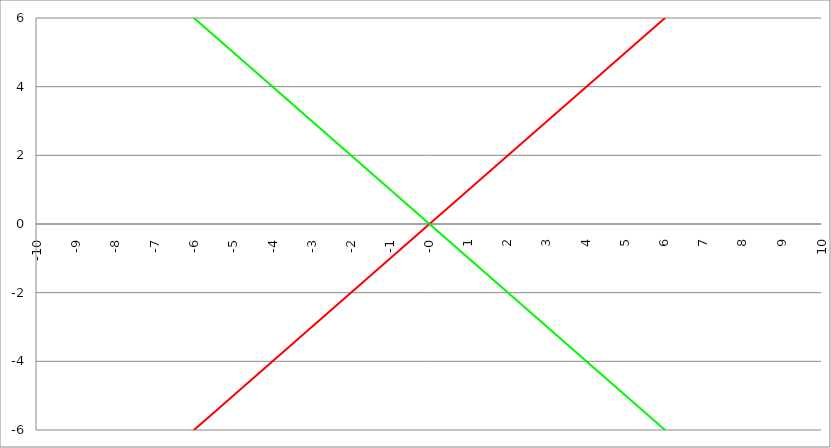
| Category | Series 1 | Series 0 | Series 2 |
|---|---|---|---|
| -10.0 | -10 | 10 |  |
| -9.99 | -9.99 | 9.99 |  |
| -9.98 | -9.98 | 9.98 |  |
| -9.97 | -9.97 | 9.97 |  |
| -9.96 | -9.96 | 9.96 |  |
| -9.95 | -9.95 | 9.95 |  |
| -9.940000000000001 | -9.94 | 9.94 |  |
| -9.930000000000001 | -9.93 | 9.93 |  |
| -9.920000000000002 | -9.92 | 9.92 |  |
| -9.91 | -9.91 | 9.91 |  |
| -9.900000000000002 | -9.9 | 9.9 |  |
| -9.890000000000002 | -9.89 | 9.89 |  |
| -9.880000000000003 | -9.88 | 9.88 |  |
| -9.870000000000003 | -9.87 | 9.87 |  |
| -9.860000000000001 | -9.86 | 9.86 |  |
| -9.850000000000003 | -9.85 | 9.85 |  |
| -9.840000000000003 | -9.84 | 9.84 |  |
| -9.830000000000004 | -9.83 | 9.83 |  |
| -9.820000000000004 | -9.82 | 9.82 |  |
| -9.810000000000004 | -9.81 | 9.81 |  |
| -9.800000000000004 | -9.8 | 9.8 |  |
| -9.790000000000004 | -9.79 | 9.79 |  |
| -9.780000000000005 | -9.78 | 9.78 |  |
| -9.770000000000005 | -9.77 | 9.77 |  |
| -9.760000000000005 | -9.76 | 9.76 |  |
| -9.750000000000005 | -9.75 | 9.75 |  |
| -9.740000000000006 | -9.74 | 9.74 |  |
| -9.730000000000006 | -9.73 | 9.73 |  |
| -9.720000000000006 | -9.72 | 9.72 |  |
| -9.710000000000006 | -9.71 | 9.71 |  |
| -9.700000000000006 | -9.7 | 9.7 |  |
| -9.690000000000007 | -9.69 | 9.69 |  |
| -9.680000000000007 | -9.68 | 9.68 |  |
| -9.670000000000007 | -9.67 | 9.67 |  |
| -9.660000000000007 | -9.66 | 9.66 |  |
| -9.650000000000007 | -9.65 | 9.65 |  |
| -9.640000000000008 | -9.64 | 9.64 |  |
| -9.630000000000008 | -9.63 | 9.63 |  |
| -9.620000000000008 | -9.62 | 9.62 |  |
| -9.610000000000008 | -9.61 | 9.61 |  |
| -9.600000000000009 | -9.6 | 9.6 |  |
| -9.590000000000009 | -9.59 | 9.59 |  |
| -9.580000000000007 | -9.58 | 9.58 |  |
| -9.57000000000001 | -9.57 | 9.57 |  |
| -9.56000000000001 | -9.56 | 9.56 |  |
| -9.55000000000001 | -9.55 | 9.55 |  |
| -9.54000000000001 | -9.54 | 9.54 |  |
| -9.53000000000001 | -9.53 | 9.53 |  |
| -9.52000000000001 | -9.52 | 9.52 |  |
| -9.51000000000001 | -9.51 | 9.51 |  |
| -9.50000000000001 | -9.5 | 9.5 |  |
| -9.49000000000001 | -9.49 | 9.49 |  |
| -9.48000000000001 | -9.48 | 9.48 |  |
| -9.47000000000001 | -9.47 | 9.47 |  |
| -9.46000000000001 | -9.46 | 9.46 |  |
| -9.45000000000001 | -9.45 | 9.45 |  |
| -9.44000000000001 | -9.44 | 9.44 |  |
| -9.430000000000012 | -9.43 | 9.43 |  |
| -9.420000000000012 | -9.42 | 9.42 |  |
| -9.410000000000013 | -9.41 | 9.41 |  |
| -9.400000000000013 | -9.4 | 9.4 |  |
| -9.390000000000011 | -9.39 | 9.39 |  |
| -9.380000000000013 | -9.38 | 9.38 |  |
| -9.370000000000013 | -9.37 | 9.37 |  |
| -9.360000000000014 | -9.36 | 9.36 |  |
| -9.350000000000014 | -9.35 | 9.35 |  |
| -9.340000000000014 | -9.34 | 9.34 |  |
| -9.330000000000014 | -9.33 | 9.33 |  |
| -9.320000000000014 | -9.32 | 9.32 |  |
| -9.310000000000015 | -9.31 | 9.31 |  |
| -9.300000000000013 | -9.3 | 9.3 |  |
| -9.290000000000015 | -9.29 | 9.29 |  |
| -9.280000000000015 | -9.28 | 9.28 |  |
| -9.270000000000016 | -9.27 | 9.27 |  |
| -9.260000000000016 | -9.26 | 9.26 |  |
| -9.250000000000014 | -9.25 | 9.25 |  |
| -9.240000000000016 | -9.24 | 9.24 |  |
| -9.230000000000016 | -9.23 | 9.23 |  |
| -9.220000000000017 | -9.22 | 9.22 |  |
| -9.210000000000017 | -9.21 | 9.21 |  |
| -9.200000000000017 | -9.2 | 9.2 |  |
| -9.190000000000017 | -9.19 | 9.19 |  |
| -9.180000000000017 | -9.18 | 9.18 |  |
| -9.170000000000018 | -9.17 | 9.17 |  |
| -9.160000000000016 | -9.16 | 9.16 |  |
| -9.150000000000018 | -9.15 | 9.15 |  |
| -9.140000000000018 | -9.14 | 9.14 |  |
| -9.130000000000019 | -9.13 | 9.13 |  |
| -9.120000000000019 | -9.12 | 9.12 |  |
| -9.110000000000017 | -9.11 | 9.11 |  |
| -9.10000000000002 | -9.1 | 9.1 |  |
| -9.09000000000002 | -9.09 | 9.09 |  |
| -9.08000000000002 | -9.08 | 9.08 |  |
| -9.07000000000002 | -9.07 | 9.07 |  |
| -9.06000000000002 | -9.06 | 9.06 |  |
| -9.05000000000002 | -9.05 | 9.05 |  |
| -9.04000000000002 | -9.04 | 9.04 |  |
| -9.03000000000002 | -9.03 | 9.03 |  |
| -9.020000000000021 | -9.02 | 9.02 |  |
| -9.010000000000021 | -9.01 | 9.01 |  |
| -9.000000000000021 | -9 | 9 |  |
| -8.990000000000022 | -8.99 | 8.99 |  |
| -8.980000000000022 | -8.98 | 8.98 |  |
| -8.97000000000002 | -8.97 | 8.97 |  |
| -8.960000000000022 | -8.96 | 8.96 |  |
| -8.950000000000022 | -8.95 | 8.95 |  |
| -8.940000000000023 | -8.94 | 8.94 |  |
| -8.930000000000023 | -8.93 | 8.93 |  |
| -8.920000000000023 | -8.92 | 8.92 |  |
| -8.910000000000023 | -8.91 | 8.91 |  |
| -8.900000000000023 | -8.9 | 8.9 |  |
| -8.890000000000024 | -8.89 | 8.89 |  |
| -8.880000000000024 | -8.88 | 8.88 |  |
| -8.870000000000024 | -8.87 | 8.87 |  |
| -8.860000000000024 | -8.86 | 8.86 |  |
| -8.850000000000025 | -8.85 | 8.85 |  |
| -8.840000000000025 | -8.84 | 8.84 |  |
| -8.830000000000025 | -8.83 | 8.83 |  |
| -8.820000000000025 | -8.82 | 8.82 |  |
| -8.810000000000025 | -8.81 | 8.81 |  |
| -8.800000000000026 | -8.8 | 8.8 |  |
| -8.790000000000026 | -8.79 | 8.79 |  |
| -8.780000000000026 | -8.78 | 8.78 |  |
| -8.770000000000026 | -8.77 | 8.77 |  |
| -8.760000000000026 | -8.76 | 8.76 |  |
| -8.750000000000027 | -8.75 | 8.75 |  |
| -8.740000000000027 | -8.74 | 8.74 |  |
| -8.730000000000027 | -8.73 | 8.73 |  |
| -8.720000000000027 | -8.72 | 8.72 |  |
| -8.710000000000027 | -8.71 | 8.71 |  |
| -8.700000000000028 | -8.7 | 8.7 |  |
| -8.690000000000028 | -8.69 | 8.69 |  |
| -8.680000000000028 | -8.68 | 8.68 |  |
| -8.670000000000028 | -8.67 | 8.67 |  |
| -8.660000000000029 | -8.66 | 8.66 |  |
| -8.650000000000029 | -8.65 | 8.65 |  |
| -8.640000000000029 | -8.64 | 8.64 |  |
| -8.63000000000003 | -8.63 | 8.63 |  |
| -8.62000000000003 | -8.62 | 8.62 |  |
| -8.61000000000003 | -8.61 | 8.61 |  |
| -8.60000000000003 | -8.6 | 8.6 |  |
| -8.59000000000003 | -8.59 | 8.59 |  |
| -8.58000000000003 | -8.58 | 8.58 |  |
| -8.57000000000003 | -8.57 | 8.57 |  |
| -8.56000000000003 | -8.56 | 8.56 |  |
| -8.55000000000003 | -8.55 | 8.55 |  |
| -8.540000000000031 | -8.54 | 8.54 |  |
| -8.530000000000031 | -8.53 | 8.53 |  |
| -8.520000000000032 | -8.52 | 8.52 |  |
| -8.510000000000032 | -8.51 | 8.51 |  |
| -8.50000000000003 | -8.5 | 8.5 |  |
| -8.490000000000032 | -8.49 | 8.49 |  |
| -8.480000000000032 | -8.48 | 8.48 |  |
| -8.470000000000033 | -8.47 | 8.47 |  |
| -8.460000000000033 | -8.46 | 8.46 |  |
| -8.450000000000033 | -8.45 | 8.45 |  |
| -8.440000000000033 | -8.44 | 8.44 |  |
| -8.430000000000033 | -8.43 | 8.43 |  |
| -8.420000000000034 | -8.42 | 8.42 |  |
| -8.410000000000032 | -8.41 | 8.41 |  |
| -8.400000000000034 | -8.4 | 8.4 |  |
| -8.390000000000034 | -8.39 | 8.39 |  |
| -8.380000000000035 | -8.38 | 8.38 |  |
| -8.370000000000035 | -8.37 | 8.37 |  |
| -8.360000000000033 | -8.36 | 8.36 |  |
| -8.350000000000035 | -8.35 | 8.35 |  |
| -8.340000000000035 | -8.34 | 8.34 |  |
| -8.330000000000036 | -8.33 | 8.33 |  |
| -8.320000000000036 | -8.32 | 8.32 |  |
| -8.310000000000034 | -8.31 | 8.31 |  |
| -8.300000000000036 | -8.3 | 8.3 |  |
| -8.290000000000036 | -8.29 | 8.29 |  |
| -8.280000000000037 | -8.28 | 8.28 |  |
| -8.270000000000037 | -8.27 | 8.27 |  |
| -8.260000000000037 | -8.26 | 8.26 |  |
| -8.250000000000037 | -8.25 | 8.25 |  |
| -8.240000000000038 | -8.24 | 8.24 |  |
| -8.230000000000038 | -8.23 | 8.23 |  |
| -8.220000000000038 | -8.22 | 8.22 |  |
| -8.210000000000038 | -8.21 | 8.21 |  |
| -8.200000000000038 | -8.2 | 8.2 |  |
| -8.190000000000039 | -8.19 | 8.19 |  |
| -8.180000000000039 | -8.18 | 8.18 |  |
| -8.170000000000037 | -8.17 | 8.17 |  |
| -8.16000000000004 | -8.16 | 8.16 |  |
| -8.15000000000004 | -8.15 | 8.15 |  |
| -8.14000000000004 | -8.14 | 8.14 |  |
| -8.13000000000004 | -8.13 | 8.13 |  |
| -8.12000000000004 | -8.12 | 8.12 |  |
| -8.11000000000004 | -8.11 | 8.11 |  |
| -8.10000000000004 | -8.1 | 8.1 |  |
| -8.09000000000004 | -8.09 | 8.09 |  |
| -8.08000000000004 | -8.08 | 8.08 |  |
| -8.07000000000004 | -8.07 | 8.07 |  |
| -8.06000000000004 | -8.06 | 8.06 |  |
| -8.05000000000004 | -8.05 | 8.05 |  |
| -8.040000000000042 | -8.04 | 8.04 |  |
| -8.03000000000004 | -8.03 | 8.03 |  |
| -8.020000000000042 | -8.02 | 8.02 |  |
| -8.010000000000042 | -8.01 | 8.01 |  |
| -8.000000000000043 | -8 | 8 |  |
| -7.990000000000043 | -7.99 | 7.99 |  |
| -7.980000000000043 | -7.98 | 7.98 |  |
| -7.970000000000043 | -7.97 | 7.97 |  |
| -7.960000000000043 | -7.96 | 7.96 |  |
| -7.950000000000044 | -7.95 | 7.95 |  |
| -7.940000000000044 | -7.94 | 7.94 |  |
| -7.930000000000044 | -7.93 | 7.93 |  |
| -7.920000000000044 | -7.92 | 7.92 |  |
| -7.910000000000044 | -7.91 | 7.91 |  |
| -7.900000000000044 | -7.9 | 7.9 |  |
| -7.890000000000045 | -7.89 | 7.89 |  |
| -7.880000000000045 | -7.88 | 7.88 |  |
| -7.870000000000045 | -7.87 | 7.87 |  |
| -7.860000000000046 | -7.86 | 7.86 |  |
| -7.850000000000046 | -7.85 | 7.85 |  |
| -7.840000000000046 | -7.84 | 7.84 |  |
| -7.830000000000046 | -7.83 | 7.83 |  |
| -7.820000000000046 | -7.82 | 7.82 |  |
| -7.810000000000047 | -7.81 | 7.81 |  |
| -7.800000000000047 | -7.8 | 7.8 |  |
| -7.790000000000047 | -7.79 | 7.79 |  |
| -7.780000000000047 | -7.78 | 7.78 |  |
| -7.770000000000047 | -7.77 | 7.77 |  |
| -7.760000000000048 | -7.76 | 7.76 |  |
| -7.750000000000048 | -7.75 | 7.75 |  |
| -7.740000000000048 | -7.74 | 7.74 |  |
| -7.730000000000048 | -7.73 | 7.73 |  |
| -7.720000000000049 | -7.72 | 7.72 |  |
| -7.710000000000049 | -7.71 | 7.71 |  |
| -7.700000000000049 | -7.7 | 7.7 |  |
| -7.690000000000049 | -7.69 | 7.69 |  |
| -7.680000000000049 | -7.68 | 7.68 |  |
| -7.67000000000005 | -7.67 | 7.67 |  |
| -7.66000000000005 | -7.66 | 7.66 |  |
| -7.65000000000005 | -7.65 | 7.65 |  |
| -7.64000000000005 | -7.64 | 7.64 |  |
| -7.63000000000005 | -7.63 | 7.63 |  |
| -7.620000000000051 | -7.62 | 7.62 |  |
| -7.610000000000051 | -7.61 | 7.61 |  |
| -7.600000000000051 | -7.6 | 7.6 |  |
| -7.590000000000051 | -7.59 | 7.59 |  |
| -7.580000000000052 | -7.58 | 7.58 |  |
| -7.570000000000052 | -7.57 | 7.57 |  |
| -7.560000000000052 | -7.56 | 7.56 |  |
| -7.550000000000052 | -7.55 | 7.55 |  |
| -7.540000000000052 | -7.54 | 7.54 |  |
| -7.530000000000053 | -7.53 | 7.53 |  |
| -7.520000000000053 | -7.52 | 7.52 |  |
| -7.510000000000053 | -7.51 | 7.51 |  |
| -7.500000000000053 | -7.5 | 7.5 |  |
| -7.490000000000053 | -7.49 | 7.49 |  |
| -7.480000000000054 | -7.48 | 7.48 |  |
| -7.470000000000054 | -7.47 | 7.47 |  |
| -7.460000000000054 | -7.46 | 7.46 |  |
| -7.450000000000054 | -7.45 | 7.45 |  |
| -7.440000000000054 | -7.44 | 7.44 |  |
| -7.430000000000054 | -7.43 | 7.43 |  |
| -7.420000000000055 | -7.42 | 7.42 |  |
| -7.410000000000055 | -7.41 | 7.41 |  |
| -7.400000000000055 | -7.4 | 7.4 |  |
| -7.390000000000056 | -7.39 | 7.39 |  |
| -7.380000000000056 | -7.38 | 7.38 |  |
| -7.370000000000056 | -7.37 | 7.37 |  |
| -7.360000000000056 | -7.36 | 7.36 |  |
| -7.350000000000056 | -7.35 | 7.35 |  |
| -7.340000000000057 | -7.34 | 7.34 |  |
| -7.330000000000057 | -7.33 | 7.33 |  |
| -7.320000000000057 | -7.32 | 7.32 |  |
| -7.310000000000057 | -7.31 | 7.31 |  |
| -7.300000000000058 | -7.3 | 7.3 |  |
| -7.290000000000058 | -7.29 | 7.29 |  |
| -7.280000000000058 | -7.28 | 7.28 |  |
| -7.270000000000058 | -7.27 | 7.27 |  |
| -7.260000000000058 | -7.26 | 7.26 |  |
| -7.250000000000059 | -7.25 | 7.25 |  |
| -7.240000000000059 | -7.24 | 7.24 |  |
| -7.23000000000006 | -7.23 | 7.23 |  |
| -7.220000000000059 | -7.22 | 7.22 |  |
| -7.210000000000059 | -7.21 | 7.21 |  |
| -7.20000000000006 | -7.2 | 7.2 |  |
| -7.19000000000006 | -7.19 | 7.19 |  |
| -7.18000000000006 | -7.18 | 7.18 |  |
| -7.17000000000006 | -7.17 | 7.17 |  |
| -7.160000000000061 | -7.16 | 7.16 |  |
| -7.150000000000061 | -7.15 | 7.15 |  |
| -7.140000000000061 | -7.14 | 7.14 |  |
| -7.130000000000061 | -7.13 | 7.13 |  |
| -7.120000000000061 | -7.12 | 7.12 |  |
| -7.110000000000062 | -7.11 | 7.11 |  |
| -7.100000000000062 | -7.1 | 7.1 |  |
| -7.090000000000062 | -7.09 | 7.09 |  |
| -7.080000000000062 | -7.08 | 7.08 |  |
| -7.070000000000062 | -7.07 | 7.07 |  |
| -7.060000000000063 | -7.06 | 7.06 |  |
| -7.050000000000063 | -7.05 | 7.05 |  |
| -7.040000000000063 | -7.04 | 7.04 |  |
| -7.030000000000063 | -7.03 | 7.03 |  |
| -7.020000000000064 | -7.02 | 7.02 |  |
| -7.010000000000064 | -7.01 | 7.01 |  |
| -7.000000000000064 | -7 | 7 |  |
| -6.990000000000064 | -6.99 | 6.99 |  |
| -6.980000000000064 | -6.98 | 6.98 |  |
| -6.970000000000064 | -6.97 | 6.97 |  |
| -6.960000000000064 | -6.96 | 6.96 |  |
| -6.950000000000064 | -6.95 | 6.95 |  |
| -6.940000000000065 | -6.94 | 6.94 |  |
| -6.930000000000065 | -6.93 | 6.93 |  |
| -6.920000000000065 | -6.92 | 6.92 |  |
| -6.910000000000065 | -6.91 | 6.91 |  |
| -6.900000000000066 | -6.9 | 6.9 |  |
| -6.890000000000066 | -6.89 | 6.89 |  |
| -6.880000000000066 | -6.88 | 6.88 |  |
| -6.870000000000066 | -6.87 | 6.87 |  |
| -6.860000000000067 | -6.86 | 6.86 |  |
| -6.850000000000067 | -6.85 | 6.85 |  |
| -6.840000000000067 | -6.84 | 6.84 |  |
| -6.830000000000067 | -6.83 | 6.83 |  |
| -6.820000000000068 | -6.82 | 6.82 |  |
| -6.810000000000068 | -6.81 | 6.81 |  |
| -6.800000000000068 | -6.8 | 6.8 |  |
| -6.790000000000068 | -6.79 | 6.79 |  |
| -6.780000000000068 | -6.78 | 6.78 |  |
| -6.770000000000068 | -6.77 | 6.77 |  |
| -6.760000000000069 | -6.76 | 6.76 |  |
| -6.75000000000007 | -6.75 | 6.75 |  |
| -6.74000000000007 | -6.74 | 6.74 |  |
| -6.73000000000007 | -6.73 | 6.73 |  |
| -6.72000000000007 | -6.72 | 6.72 |  |
| -6.71000000000007 | -6.71 | 6.71 |  |
| -6.70000000000007 | -6.7 | 6.7 |  |
| -6.69000000000007 | -6.69 | 6.69 |  |
| -6.680000000000071 | -6.68 | 6.68 |  |
| -6.670000000000071 | -6.67 | 6.67 |  |
| -6.660000000000071 | -6.66 | 6.66 |  |
| -6.650000000000071 | -6.65 | 6.65 |  |
| -6.640000000000072 | -6.64 | 6.64 |  |
| -6.630000000000072 | -6.63 | 6.63 |  |
| -6.620000000000072 | -6.62 | 6.62 |  |
| -6.610000000000072 | -6.61 | 6.61 |  |
| -6.600000000000072 | -6.6 | 6.6 |  |
| -6.590000000000073 | -6.59 | 6.59 |  |
| -6.580000000000073 | -6.58 | 6.58 |  |
| -6.570000000000073 | -6.57 | 6.57 |  |
| -6.560000000000073 | -6.56 | 6.56 |  |
| -6.550000000000074 | -6.55 | 6.55 |  |
| -6.540000000000074 | -6.54 | 6.54 |  |
| -6.530000000000074 | -6.53 | 6.53 |  |
| -6.520000000000074 | -6.52 | 6.52 |  |
| -6.510000000000074 | -6.51 | 6.51 |  |
| -6.500000000000074 | -6.5 | 6.5 |  |
| -6.490000000000074 | -6.49 | 6.49 |  |
| -6.480000000000074 | -6.48 | 6.48 |  |
| -6.470000000000075 | -6.47 | 6.47 |  |
| -6.460000000000075 | -6.46 | 6.46 |  |
| -6.450000000000075 | -6.45 | 6.45 |  |
| -6.440000000000075 | -6.44 | 6.44 |  |
| -6.430000000000076 | -6.43 | 6.43 |  |
| -6.420000000000076 | -6.42 | 6.42 |  |
| -6.410000000000076 | -6.41 | 6.41 |  |
| -6.400000000000076 | -6.4 | 6.4 |  |
| -6.390000000000077 | -6.39 | 6.39 |  |
| -6.380000000000077 | -6.38 | 6.38 |  |
| -6.370000000000077 | -6.37 | 6.37 |  |
| -6.360000000000078 | -6.36 | 6.36 |  |
| -6.350000000000078 | -6.35 | 6.35 |  |
| -6.340000000000078 | -6.34 | 6.34 |  |
| -6.330000000000078 | -6.33 | 6.33 |  |
| -6.320000000000078 | -6.32 | 6.32 |  |
| -6.310000000000079 | -6.31 | 6.31 |  |
| -6.300000000000079 | -6.3 | 6.3 |  |
| -6.29000000000008 | -6.29 | 6.29 |  |
| -6.28000000000008 | -6.28 | 6.28 |  |
| -6.27000000000008 | -6.27 | 6.27 |  |
| -6.26000000000008 | -6.26 | 6.26 |  |
| -6.25000000000008 | -6.25 | 6.25 |  |
| -6.24000000000008 | -6.24 | 6.24 |  |
| -6.23000000000008 | -6.23 | 6.23 |  |
| -6.220000000000081 | -6.22 | 6.22 |  |
| -6.210000000000081 | -6.21 | 6.21 |  |
| -6.200000000000081 | -6.2 | 6.2 |  |
| -6.190000000000081 | -6.19 | 6.19 |  |
| -6.180000000000081 | -6.18 | 6.18 |  |
| -6.170000000000082 | -6.17 | 6.17 |  |
| -6.160000000000082 | -6.16 | 6.16 |  |
| -6.150000000000082 | -6.15 | 6.15 |  |
| -6.140000000000082 | -6.14 | 6.14 |  |
| -6.130000000000082 | -6.13 | 6.13 |  |
| -6.120000000000083 | -6.12 | 6.12 |  |
| -6.110000000000083 | -6.11 | 6.11 |  |
| -6.100000000000083 | -6.1 | 6.1 |  |
| -6.090000000000083 | -6.09 | 6.09 |  |
| -6.080000000000084 | -6.08 | 6.08 |  |
| -6.070000000000084 | -6.07 | 6.07 |  |
| -6.060000000000084 | -6.06 | 6.06 |  |
| -6.050000000000084 | -6.05 | 6.05 |  |
| -6.040000000000084 | -6.04 | 6.04 |  |
| -6.030000000000084 | -6.03 | 6.03 |  |
| -6.020000000000085 | -6.02 | 6.02 |  |
| -6.010000000000085 | -6.01 | 6.01 |  |
| -6.000000000000085 | -6 | 6 |  |
| -5.990000000000085 | -5.99 | 5.99 |  |
| -5.980000000000085 | -5.98 | 5.98 |  |
| -5.970000000000085 | -5.97 | 5.97 |  |
| -5.960000000000086 | -5.96 | 5.96 |  |
| -5.950000000000086 | -5.95 | 5.95 |  |
| -5.940000000000086 | -5.94 | 5.94 |  |
| -5.930000000000086 | -5.93 | 5.93 |  |
| -5.920000000000087 | -5.92 | 5.92 |  |
| -5.910000000000087 | -5.91 | 5.91 |  |
| -5.900000000000087 | -5.9 | 5.9 |  |
| -5.890000000000088 | -5.89 | 5.89 |  |
| -5.880000000000088 | -5.88 | 5.88 |  |
| -5.870000000000088 | -5.87 | 5.87 |  |
| -5.860000000000088 | -5.86 | 5.86 |  |
| -5.850000000000088 | -5.85 | 5.85 |  |
| -5.840000000000089 | -5.84 | 5.84 |  |
| -5.830000000000089 | -5.83 | 5.83 |  |
| -5.820000000000089 | -5.82 | 5.82 |  |
| -5.810000000000089 | -5.81 | 5.81 |  |
| -5.800000000000089 | -5.8 | 5.8 |  |
| -5.79000000000009 | -5.79 | 5.79 |  |
| -5.78000000000009 | -5.78 | 5.78 |  |
| -5.77000000000009 | -5.77 | 5.77 |  |
| -5.76000000000009 | -5.76 | 5.76 |  |
| -5.750000000000091 | -5.75 | 5.75 |  |
| -5.740000000000091 | -5.74 | 5.74 |  |
| -5.730000000000091 | -5.73 | 5.73 |  |
| -5.720000000000091 | -5.72 | 5.72 |  |
| -5.710000000000091 | -5.71 | 5.71 |  |
| -5.700000000000092 | -5.7 | 5.7 |  |
| -5.690000000000092 | -5.69 | 5.69 |  |
| -5.680000000000092 | -5.68 | 5.68 |  |
| -5.670000000000092 | -5.67 | 5.67 |  |
| -5.660000000000092 | -5.66 | 5.66 |  |
| -5.650000000000093 | -5.65 | 5.65 |  |
| -5.640000000000093 | -5.64 | 5.64 |  |
| -5.630000000000093 | -5.63 | 5.63 |  |
| -5.620000000000093 | -5.62 | 5.62 |  |
| -5.610000000000093 | -5.61 | 5.61 |  |
| -5.600000000000094 | -5.6 | 5.6 |  |
| -5.590000000000094 | -5.59 | 5.59 |  |
| -5.580000000000094 | -5.58 | 5.58 |  |
| -5.570000000000094 | -5.57 | 5.57 |  |
| -5.560000000000095 | -5.56 | 5.56 |  |
| -5.550000000000095 | -5.55 | 5.55 |  |
| -5.540000000000095 | -5.54 | 5.54 |  |
| -5.530000000000095 | -5.53 | 5.53 |  |
| -5.520000000000095 | -5.52 | 5.52 |  |
| -5.510000000000096 | -5.51 | 5.51 |  |
| -5.500000000000096 | -5.5 | 5.5 |  |
| -5.490000000000096 | -5.49 | 5.49 |  |
| -5.480000000000096 | -5.48 | 5.48 |  |
| -5.470000000000096 | -5.47 | 5.47 |  |
| -5.460000000000097 | -5.46 | 5.46 |  |
| -5.450000000000097 | -5.45 | 5.45 |  |
| -5.440000000000097 | -5.44 | 5.44 |  |
| -5.430000000000097 | -5.43 | 5.43 |  |
| -5.420000000000098 | -5.42 | 5.42 |  |
| -5.410000000000098 | -5.41 | 5.41 |  |
| -5.400000000000098 | -5.4 | 5.4 |  |
| -5.390000000000098 | -5.39 | 5.39 |  |
| -5.380000000000098 | -5.38 | 5.38 |  |
| -5.370000000000099 | -5.37 | 5.37 |  |
| -5.360000000000099 | -5.36 | 5.36 |  |
| -5.350000000000099 | -5.35 | 5.35 |  |
| -5.340000000000099 | -5.34 | 5.34 |  |
| -5.330000000000099 | -5.33 | 5.33 |  |
| -5.3200000000001 | -5.32 | 5.32 |  |
| -5.3100000000001 | -5.31 | 5.31 |  |
| -5.3000000000001 | -5.3 | 5.3 |  |
| -5.2900000000001 | -5.29 | 5.29 |  |
| -5.2800000000001 | -5.28 | 5.28 |  |
| -5.2700000000001 | -5.27 | 5.27 |  |
| -5.260000000000101 | -5.26 | 5.26 |  |
| -5.250000000000101 | -5.25 | 5.25 |  |
| -5.240000000000101 | -5.24 | 5.24 |  |
| -5.230000000000101 | -5.23 | 5.23 |  |
| -5.220000000000102 | -5.22 | 5.22 |  |
| -5.210000000000102 | -5.21 | 5.21 |  |
| -5.200000000000102 | -5.2 | 5.2 |  |
| -5.190000000000103 | -5.19 | 5.19 |  |
| -5.180000000000103 | -5.18 | 5.18 |  |
| -5.170000000000103 | -5.17 | 5.17 |  |
| -5.160000000000103 | -5.16 | 5.16 |  |
| -5.150000000000103 | -5.15 | 5.15 |  |
| -5.140000000000104 | -5.14 | 5.14 |  |
| -5.130000000000104 | -5.13 | 5.13 |  |
| -5.120000000000104 | -5.12 | 5.12 |  |
| -5.110000000000104 | -5.11 | 5.11 |  |
| -5.100000000000104 | -5.1 | 5.1 |  |
| -5.090000000000104 | -5.09 | 5.09 |  |
| -5.080000000000104 | -5.08 | 5.08 |  |
| -5.070000000000105 | -5.07 | 5.07 |  |
| -5.060000000000105 | -5.06 | 5.06 |  |
| -5.050000000000105 | -5.05 | 5.05 |  |
| -5.040000000000105 | -5.04 | 5.04 |  |
| -5.030000000000105 | -5.03 | 5.03 |  |
| -5.020000000000106 | -5.02 | 5.02 |  |
| -5.010000000000106 | -5.01 | 5.01 |  |
| -5.000000000000106 | -5 | 5 |  |
| -4.990000000000106 | -4.99 | 4.99 |  |
| -4.980000000000106 | -4.98 | 4.98 |  |
| -4.970000000000107 | -4.97 | 4.97 |  |
| -4.960000000000107 | -4.96 | 4.96 |  |
| -4.950000000000107 | -4.95 | 4.95 |  |
| -4.940000000000107 | -4.94 | 4.94 |  |
| -4.930000000000108 | -4.93 | 4.93 |  |
| -4.920000000000108 | -4.92 | 4.92 |  |
| -4.910000000000108 | -4.91 | 4.91 |  |
| -4.900000000000108 | -4.9 | 4.9 |  |
| -4.890000000000109 | -4.89 | 4.89 |  |
| -4.88000000000011 | -4.88 | 4.88 |  |
| -4.87000000000011 | -4.87 | 4.87 |  |
| -4.86000000000011 | -4.86 | 4.86 |  |
| -4.85000000000011 | -4.85 | 4.85 |  |
| -4.84000000000011 | -4.84 | 4.84 |  |
| -4.83000000000011 | -4.83 | 4.83 |  |
| -4.82000000000011 | -4.82 | 4.82 |  |
| -4.810000000000111 | -4.81 | 4.81 |  |
| -4.800000000000111 | -4.8 | 4.8 |  |
| -4.790000000000111 | -4.79 | 4.79 |  |
| -4.780000000000111 | -4.78 | 4.78 |  |
| -4.770000000000111 | -4.77 | 4.77 |  |
| -4.760000000000112 | -4.76 | 4.76 |  |
| -4.750000000000112 | -4.75 | 4.75 |  |
| -4.740000000000112 | -4.74 | 4.74 |  |
| -4.730000000000112 | -4.73 | 4.73 |  |
| -4.720000000000112 | -4.72 | 4.72 |  |
| -4.710000000000113 | -4.71 | 4.71 |  |
| -4.700000000000113 | -4.7 | 4.7 |  |
| -4.690000000000113 | -4.69 | 4.69 |  |
| -4.680000000000113 | -4.68 | 4.68 |  |
| -4.670000000000114 | -4.67 | 4.67 |  |
| -4.660000000000114 | -4.66 | 4.66 |  |
| -4.650000000000114 | -4.65 | 4.65 |  |
| -4.640000000000114 | -4.64 | 4.64 |  |
| -4.630000000000114 | -4.63 | 4.63 |  |
| -4.620000000000115 | -4.62 | 4.62 |  |
| -4.610000000000115 | -4.61 | 4.61 |  |
| -4.600000000000115 | -4.6 | 4.6 |  |
| -4.590000000000115 | -4.59 | 4.59 |  |
| -4.580000000000115 | -4.58 | 4.58 |  |
| -4.570000000000115 | -4.57 | 4.57 |  |
| -4.560000000000116 | -4.56 | 4.56 |  |
| -4.550000000000116 | -4.55 | 4.55 |  |
| -4.540000000000116 | -4.54 | 4.54 |  |
| -4.530000000000116 | -4.53 | 4.53 |  |
| -4.520000000000117 | -4.52 | 4.52 |  |
| -4.510000000000117 | -4.51 | 4.51 |  |
| -4.500000000000117 | -4.5 | 4.5 |  |
| -4.490000000000117 | -4.49 | 4.49 |  |
| -4.480000000000117 | -4.48 | 4.48 |  |
| -4.470000000000117 | -4.47 | 4.47 |  |
| -4.460000000000118 | -4.46 | 4.46 |  |
| -4.450000000000118 | -4.45 | 4.45 |  |
| -4.440000000000118 | -4.44 | 4.44 |  |
| -4.430000000000118 | -4.43 | 4.43 |  |
| -4.420000000000119 | -4.42 | 4.42 |  |
| -4.41000000000012 | -4.41 | 4.41 |  |
| -4.40000000000012 | -4.4 | 4.4 |  |
| -4.39000000000012 | -4.39 | 4.39 |  |
| -4.38000000000012 | -4.38 | 4.38 |  |
| -4.37000000000012 | -4.37 | 4.37 |  |
| -4.36000000000012 | -4.36 | 4.36 |  |
| -4.35000000000012 | -4.35 | 4.35 |  |
| -4.34000000000012 | -4.34 | 4.34 |  |
| -4.33000000000012 | -4.33 | 4.33 |  |
| -4.320000000000121 | -4.32 | 4.32 |  |
| -4.310000000000121 | -4.31 | 4.31 |  |
| -4.300000000000121 | -4.3 | 4.3 |  |
| -4.290000000000121 | -4.29 | 4.29 |  |
| -4.280000000000121 | -4.28 | 4.28 |  |
| -4.270000000000122 | -4.27 | 4.27 |  |
| -4.260000000000122 | -4.26 | 4.26 |  |
| -4.250000000000122 | -4.25 | 4.25 |  |
| -4.240000000000122 | -4.24 | 4.24 |  |
| -4.230000000000122 | -4.23 | 4.23 |  |
| -4.220000000000123 | -4.22 | 4.22 |  |
| -4.210000000000123 | -4.21 | 4.21 |  |
| -4.200000000000123 | -4.2 | 4.2 |  |
| -4.190000000000124 | -4.19 | 4.19 |  |
| -4.180000000000124 | -4.18 | 4.18 |  |
| -4.170000000000124 | -4.17 | 4.17 |  |
| -4.160000000000124 | -4.16 | 4.16 |  |
| -4.150000000000124 | -4.15 | 4.15 |  |
| -4.140000000000124 | -4.14 | 4.14 |  |
| -4.130000000000125 | -4.13 | 4.13 |  |
| -4.120000000000125 | -4.12 | 4.12 |  |
| -4.110000000000125 | -4.11 | 4.11 |  |
| -4.100000000000125 | -4.1 | 4.1 |  |
| -4.090000000000125 | -4.09 | 4.09 |  |
| -4.080000000000126 | -4.08 | 4.08 |  |
| -4.070000000000126 | -4.07 | 4.07 |  |
| -4.060000000000126 | -4.06 | 4.06 |  |
| -4.050000000000126 | -4.05 | 4.05 |  |
| -4.040000000000127 | -4.04 | 4.04 |  |
| -4.030000000000127 | -4.03 | 4.03 |  |
| -4.020000000000127 | -4.02 | 4.02 |  |
| -4.010000000000127 | -4.01 | 4.01 |  |
| -4.000000000000127 | -4 | 4 |  |
| -3.990000000000128 | -3.99 | 3.99 |  |
| -3.980000000000128 | -3.98 | 3.98 |  |
| -3.970000000000129 | -3.97 | 3.97 |  |
| -3.960000000000129 | -3.96 | 3.96 |  |
| -3.950000000000129 | -3.95 | 3.95 |  |
| -3.940000000000129 | -3.94 | 3.94 |  |
| -3.930000000000129 | -3.93 | 3.93 |  |
| -3.92000000000013 | -3.92 | 3.92 |  |
| -3.91000000000013 | -3.91 | 3.91 |  |
| -3.90000000000013 | -3.9 | 3.9 |  |
| -3.89000000000013 | -3.89 | 3.89 |  |
| -3.88000000000013 | -3.88 | 3.88 |  |
| -3.870000000000131 | -3.87 | 3.87 |  |
| -3.860000000000131 | -3.86 | 3.86 |  |
| -3.850000000000131 | -3.85 | 3.85 |  |
| -3.840000000000131 | -3.84 | 3.84 |  |
| -3.830000000000131 | -3.83 | 3.83 |  |
| -3.820000000000132 | -3.82 | 3.82 |  |
| -3.810000000000132 | -3.81 | 3.81 |  |
| -3.800000000000132 | -3.8 | 3.8 |  |
| -3.790000000000132 | -3.79 | 3.79 |  |
| -3.780000000000132 | -3.78 | 3.78 |  |
| -3.770000000000133 | -3.77 | 3.77 |  |
| -3.760000000000133 | -3.76 | 3.76 |  |
| -3.750000000000133 | -3.75 | 3.75 |  |
| -3.740000000000133 | -3.74 | 3.74 |  |
| -3.730000000000134 | -3.73 | 3.73 |  |
| -3.720000000000134 | -3.72 | 3.72 |  |
| -3.710000000000134 | -3.71 | 3.71 |  |
| -3.700000000000134 | -3.7 | 3.7 |  |
| -3.690000000000134 | -3.69 | 3.69 |  |
| -3.680000000000135 | -3.68 | 3.68 |  |
| -3.670000000000135 | -3.67 | 3.67 |  |
| -3.660000000000135 | -3.66 | 3.66 |  |
| -3.650000000000135 | -3.65 | 3.65 |  |
| -3.640000000000135 | -3.64 | 3.64 |  |
| -3.630000000000136 | -3.63 | 3.63 |  |
| -3.620000000000136 | -3.62 | 3.62 |  |
| -3.610000000000136 | -3.61 | 3.61 |  |
| -3.600000000000136 | -3.6 | 3.6 |  |
| -3.590000000000137 | -3.59 | 3.59 |  |
| -3.580000000000137 | -3.58 | 3.58 |  |
| -3.570000000000137 | -3.57 | 3.57 |  |
| -3.560000000000137 | -3.56 | 3.56 |  |
| -3.550000000000137 | -3.55 | 3.55 |  |
| -3.540000000000138 | -3.54 | 3.54 |  |
| -3.530000000000138 | -3.53 | 3.53 |  |
| -3.520000000000138 | -3.52 | 3.52 |  |
| -3.510000000000138 | -3.51 | 3.51 |  |
| -3.500000000000139 | -3.5 | 3.5 |  |
| -3.490000000000139 | -3.49 | 3.49 |  |
| -3.480000000000139 | -3.48 | 3.48 |  |
| -3.470000000000139 | -3.47 | 3.47 |  |
| -3.460000000000139 | -3.46 | 3.46 |  |
| -3.45000000000014 | -3.45 | 3.45 |  |
| -3.44000000000014 | -3.44 | 3.44 |  |
| -3.43000000000014 | -3.43 | 3.43 |  |
| -3.42000000000014 | -3.42 | 3.42 |  |
| -3.41000000000014 | -3.41 | 3.41 |  |
| -3.400000000000141 | -3.4 | 3.4 |  |
| -3.390000000000141 | -3.39 | 3.39 |  |
| -3.380000000000141 | -3.38 | 3.38 |  |
| -3.370000000000141 | -3.37 | 3.37 |  |
| -3.360000000000141 | -3.36 | 3.36 |  |
| -3.350000000000142 | -3.35 | 3.35 |  |
| -3.340000000000142 | -3.34 | 3.34 |  |
| -3.330000000000142 | -3.33 | 3.33 |  |
| -3.320000000000142 | -3.32 | 3.32 |  |
| -3.310000000000143 | -3.31 | 3.31 |  |
| -3.300000000000143 | -3.3 | 3.3 |  |
| -3.290000000000143 | -3.29 | 3.29 |  |
| -3.280000000000143 | -3.28 | 3.28 |  |
| -3.270000000000143 | -3.27 | 3.27 |  |
| -3.260000000000144 | -3.26 | 3.26 |  |
| -3.250000000000144 | -3.25 | 3.25 |  |
| -3.240000000000144 | -3.24 | 3.24 |  |
| -3.230000000000144 | -3.23 | 3.23 |  |
| -3.220000000000145 | -3.22 | 3.22 |  |
| -3.210000000000145 | -3.21 | 3.21 |  |
| -3.200000000000145 | -3.2 | 3.2 |  |
| -3.190000000000145 | -3.19 | 3.19 |  |
| -3.180000000000145 | -3.18 | 3.18 |  |
| -3.170000000000146 | -3.17 | 3.17 |  |
| -3.160000000000146 | -3.16 | 3.16 |  |
| -3.150000000000146 | -3.15 | 3.15 |  |
| -3.140000000000146 | -3.14 | 3.14 |  |
| -3.130000000000146 | -3.13 | 3.13 |  |
| -3.120000000000147 | -3.12 | 3.12 |  |
| -3.110000000000147 | -3.11 | 3.11 |  |
| -3.100000000000147 | -3.1 | 3.1 |  |
| -3.090000000000147 | -3.09 | 3.09 |  |
| -3.080000000000147 | -3.08 | 3.08 |  |
| -3.070000000000148 | -3.07 | 3.07 |  |
| -3.060000000000148 | -3.06 | 3.06 |  |
| -3.050000000000148 | -3.05 | 3.05 |  |
| -3.040000000000148 | -3.04 | 3.04 |  |
| -3.030000000000149 | -3.03 | 3.03 |  |
| -3.020000000000149 | -3.02 | 3.02 |  |
| -3.010000000000149 | -3.01 | 3.01 |  |
| -3.000000000000149 | -3 | 3 |  |
| -2.990000000000149 | -2.99 | 2.99 |  |
| -2.98000000000015 | -2.98 | 2.98 |  |
| -2.97000000000015 | -2.97 | 2.97 |  |
| -2.96000000000015 | -2.96 | 2.96 |  |
| -2.95000000000015 | -2.95 | 2.95 |  |
| -2.94000000000015 | -2.94 | 2.94 |  |
| -2.930000000000151 | -2.93 | 2.93 |  |
| -2.920000000000151 | -2.92 | 2.92 |  |
| -2.910000000000151 | -2.91 | 2.91 |  |
| -2.900000000000151 | -2.9 | 2.9 |  |
| -2.890000000000151 | -2.89 | 2.89 |  |
| -2.880000000000152 | -2.88 | 2.88 |  |
| -2.870000000000152 | -2.87 | 2.87 |  |
| -2.860000000000152 | -2.86 | 2.86 |  |
| -2.850000000000152 | -2.85 | 2.85 |  |
| -2.840000000000153 | -2.84 | 2.84 |  |
| -2.830000000000153 | -2.83 | 2.83 |  |
| -2.820000000000153 | -2.82 | 2.82 |  |
| -2.810000000000153 | -2.81 | 2.81 |  |
| -2.800000000000153 | -2.8 | 2.8 |  |
| -2.790000000000154 | -2.79 | 2.79 |  |
| -2.780000000000154 | -2.78 | 2.78 |  |
| -2.770000000000154 | -2.77 | 2.77 |  |
| -2.760000000000154 | -2.76 | 2.76 |  |
| -2.750000000000154 | -2.75 | 2.75 |  |
| -2.740000000000155 | -2.74 | 2.74 |  |
| -2.730000000000155 | -2.73 | 2.73 |  |
| -2.720000000000155 | -2.72 | 2.72 |  |
| -2.710000000000155 | -2.71 | 2.71 |  |
| -2.700000000000156 | -2.7 | 2.7 |  |
| -2.690000000000156 | -2.69 | 2.69 |  |
| -2.680000000000156 | -2.68 | 2.68 |  |
| -2.670000000000156 | -2.67 | 2.67 |  |
| -2.660000000000156 | -2.66 | 2.66 |  |
| -2.650000000000157 | -2.65 | 2.65 |  |
| -2.640000000000157 | -2.64 | 2.64 |  |
| -2.630000000000157 | -2.63 | 2.63 |  |
| -2.620000000000157 | -2.62 | 2.62 |  |
| -2.610000000000157 | -2.61 | 2.61 |  |
| -2.600000000000158 | -2.6 | 2.6 |  |
| -2.590000000000158 | -2.59 | 2.59 |  |
| -2.580000000000158 | -2.58 | 2.58 |  |
| -2.570000000000158 | -2.57 | 2.57 |  |
| -2.560000000000159 | -2.56 | 2.56 |  |
| -2.550000000000159 | -2.55 | 2.55 |  |
| -2.54000000000016 | -2.54 | 2.54 |  |
| -2.530000000000159 | -2.53 | 2.53 |  |
| -2.520000000000159 | -2.52 | 2.52 |  |
| -2.51000000000016 | -2.51 | 2.51 |  |
| -2.50000000000016 | -2.5 | 2.5 |  |
| -2.49000000000016 | -2.49 | 2.49 |  |
| -2.48000000000016 | -2.48 | 2.48 |  |
| -2.47000000000016 | -2.47 | 2.47 |  |
| -2.460000000000161 | -2.46 | 2.46 |  |
| -2.450000000000161 | -2.45 | 2.45 |  |
| -2.440000000000161 | -2.44 | 2.44 |  |
| -2.430000000000161 | -2.43 | 2.43 |  |
| -2.420000000000162 | -2.42 | 2.42 |  |
| -2.410000000000162 | -2.41 | 2.41 |  |
| -2.400000000000162 | -2.4 | 2.4 |  |
| -2.390000000000162 | -2.39 | 2.39 |  |
| -2.380000000000162 | -2.38 | 2.38 |  |
| -2.370000000000163 | -2.37 | 2.37 |  |
| -2.360000000000163 | -2.36 | 2.36 |  |
| -2.350000000000163 | -2.35 | 2.35 |  |
| -2.340000000000163 | -2.34 | 2.34 |  |
| -2.330000000000163 | -2.33 | 2.33 |  |
| -2.320000000000164 | -2.32 | 2.32 |  |
| -2.310000000000164 | -2.31 | 2.31 |  |
| -2.300000000000164 | -2.3 | 2.3 |  |
| -2.290000000000164 | -2.29 | 2.29 |  |
| -2.280000000000165 | -2.28 | 2.28 |  |
| -2.270000000000165 | -2.27 | 2.27 |  |
| -2.260000000000165 | -2.26 | 2.26 |  |
| -2.250000000000165 | -2.25 | 2.25 |  |
| -2.240000000000165 | -2.24 | 2.24 |  |
| -2.230000000000166 | -2.23 | 2.23 |  |
| -2.220000000000166 | -2.22 | 2.22 |  |
| -2.210000000000166 | -2.21 | 2.21 |  |
| -2.200000000000166 | -2.2 | 2.2 |  |
| -2.190000000000166 | -2.19 | 2.19 |  |
| -2.180000000000167 | -2.18 | 2.18 |  |
| -2.170000000000167 | -2.17 | 2.17 |  |
| -2.160000000000167 | -2.16 | 2.16 |  |
| -2.150000000000167 | -2.15 | 2.15 |  |
| -2.140000000000168 | -2.14 | 2.14 |  |
| -2.130000000000168 | -2.13 | 2.13 |  |
| -2.120000000000168 | -2.12 | 2.12 |  |
| -2.110000000000168 | -2.11 | 2.11 |  |
| -2.100000000000168 | -2.1 | 2.1 |  |
| -2.090000000000169 | -2.09 | 2.09 |  |
| -2.080000000000169 | -2.08 | 2.08 |  |
| -2.070000000000169 | -2.07 | 2.07 |  |
| -2.060000000000169 | -2.06 | 2.06 |  |
| -2.050000000000169 | -2.05 | 2.05 |  |
| -2.04000000000017 | -2.04 | 2.04 |  |
| -2.03000000000017 | -2.03 | 2.03 |  |
| -2.02000000000017 | -2.02 | 2.02 |  |
| -2.01000000000017 | -2.01 | 2.01 |  |
| -2.000000000000171 | -2 | 2 |  |
| -1.99000000000017 | -1.99 | 1.99 |  |
| -1.98000000000017 | -1.98 | 1.98 |  |
| -1.97000000000017 | -1.97 | 1.97 |  |
| -1.96000000000017 | -1.96 | 1.96 |  |
| -1.95000000000017 | -1.95 | 1.95 |  |
| -1.94000000000017 | -1.94 | 1.94 |  |
| -1.93000000000017 | -1.93 | 1.93 |  |
| -1.92000000000017 | -1.92 | 1.92 |  |
| -1.91000000000017 | -1.91 | 1.91 |  |
| -1.90000000000017 | -1.9 | 1.9 |  |
| -1.89000000000017 | -1.89 | 1.89 |  |
| -1.88000000000017 | -1.88 | 1.88 |  |
| -1.87000000000017 | -1.87 | 1.87 |  |
| -1.86000000000017 | -1.86 | 1.86 |  |
| -1.85000000000017 | -1.85 | 1.85 |  |
| -1.84000000000017 | -1.84 | 1.84 |  |
| -1.83000000000017 | -1.83 | 1.83 |  |
| -1.82000000000017 | -1.82 | 1.82 |  |
| -1.81000000000017 | -1.81 | 1.81 |  |
| -1.80000000000017 | -1.8 | 1.8 |  |
| -1.79000000000017 | -1.79 | 1.79 |  |
| -1.78000000000017 | -1.78 | 1.78 |  |
| -1.77000000000017 | -1.77 | 1.77 |  |
| -1.76000000000017 | -1.76 | 1.76 |  |
| -1.75000000000017 | -1.75 | 1.75 |  |
| -1.74000000000017 | -1.74 | 1.74 |  |
| -1.73000000000017 | -1.73 | 1.73 |  |
| -1.72000000000017 | -1.72 | 1.72 |  |
| -1.71000000000017 | -1.71 | 1.71 |  |
| -1.70000000000017 | -1.7 | 1.7 |  |
| -1.69000000000017 | -1.69 | 1.69 |  |
| -1.68000000000017 | -1.68 | 1.68 |  |
| -1.67000000000017 | -1.67 | 1.67 |  |
| -1.66000000000017 | -1.66 | 1.66 |  |
| -1.65000000000017 | -1.65 | 1.65 |  |
| -1.64000000000017 | -1.64 | 1.64 |  |
| -1.63000000000017 | -1.63 | 1.63 |  |
| -1.62000000000017 | -1.62 | 1.62 |  |
| -1.61000000000017 | -1.61 | 1.61 |  |
| -1.60000000000017 | -1.6 | 1.6 |  |
| -1.59000000000017 | -1.59 | 1.59 |  |
| -1.58000000000017 | -1.58 | 1.58 |  |
| -1.57000000000017 | -1.57 | 1.57 |  |
| -1.56000000000017 | -1.56 | 1.56 |  |
| -1.55000000000017 | -1.55 | 1.55 |  |
| -1.54000000000017 | -1.54 | 1.54 |  |
| -1.53000000000017 | -1.53 | 1.53 |  |
| -1.52000000000017 | -1.52 | 1.52 |  |
| -1.51000000000017 | -1.51 | 1.51 |  |
| -1.50000000000017 | -1.5 | 1.5 |  |
| -1.49000000000017 | -1.49 | 1.49 |  |
| -1.48000000000017 | -1.48 | 1.48 |  |
| -1.47000000000017 | -1.47 | 1.47 |  |
| -1.46000000000017 | -1.46 | 1.46 |  |
| -1.45000000000017 | -1.45 | 1.45 |  |
| -1.44000000000017 | -1.44 | 1.44 |  |
| -1.43000000000017 | -1.43 | 1.43 |  |
| -1.42000000000017 | -1.42 | 1.42 |  |
| -1.41000000000017 | -1.41 | 1.41 |  |
| -1.40000000000017 | -1.4 | 1.4 |  |
| -1.39000000000017 | -1.39 | 1.39 |  |
| -1.38000000000017 | -1.38 | 1.38 |  |
| -1.37000000000017 | -1.37 | 1.37 |  |
| -1.36000000000017 | -1.36 | 1.36 |  |
| -1.35000000000017 | -1.35 | 1.35 |  |
| -1.34000000000017 | -1.34 | 1.34 |  |
| -1.33000000000017 | -1.33 | 1.33 |  |
| -1.32000000000017 | -1.32 | 1.32 |  |
| -1.31000000000017 | -1.31 | 1.31 |  |
| -1.30000000000017 | -1.3 | 1.3 |  |
| -1.29000000000017 | -1.29 | 1.29 |  |
| -1.28000000000017 | -1.28 | 1.28 |  |
| -1.27000000000017 | -1.27 | 1.27 |  |
| -1.26000000000017 | -1.26 | 1.26 |  |
| -1.25000000000017 | -1.25 | 1.25 |  |
| -1.24000000000017 | -1.24 | 1.24 |  |
| -1.23000000000017 | -1.23 | 1.23 |  |
| -1.22000000000017 | -1.22 | 1.22 |  |
| -1.21000000000017 | -1.21 | 1.21 |  |
| -1.20000000000017 | -1.2 | 1.2 |  |
| -1.19000000000017 | -1.19 | 1.19 |  |
| -1.18000000000017 | -1.18 | 1.18 |  |
| -1.17000000000017 | -1.17 | 1.17 |  |
| -1.16000000000017 | -1.16 | 1.16 |  |
| -1.15000000000017 | -1.15 | 1.15 |  |
| -1.14000000000017 | -1.14 | 1.14 |  |
| -1.13000000000017 | -1.13 | 1.13 |  |
| -1.12000000000017 | -1.12 | 1.12 |  |
| -1.11000000000017 | -1.11 | 1.11 |  |
| -1.10000000000017 | -1.1 | 1.1 |  |
| -1.09000000000017 | -1.09 | 1.09 |  |
| -1.08000000000017 | -1.08 | 1.08 |  |
| -1.07000000000017 | -1.07 | 1.07 |  |
| -1.06000000000017 | -1.06 | 1.06 |  |
| -1.05000000000017 | -1.05 | 1.05 |  |
| -1.04000000000017 | -1.04 | 1.04 |  |
| -1.03000000000017 | -1.03 | 1.03 |  |
| -1.02000000000017 | -1.02 | 1.02 |  |
| -1.01000000000017 | -1.01 | 1.01 |  |
| -1.00000000000017 | -1 | 1 |  |
| -0.99000000000017 | -0.99 | 0.99 |  |
| -0.98000000000017 | -0.98 | 0.98 |  |
| -0.97000000000017 | -0.97 | 0.97 |  |
| -0.96000000000017 | -0.96 | 0.96 |  |
| -0.95000000000017 | -0.95 | 0.95 |  |
| -0.94000000000017 | -0.94 | 0.94 |  |
| -0.93000000000017 | -0.93 | 0.93 |  |
| -0.92000000000017 | -0.92 | 0.92 |  |
| -0.91000000000017 | -0.91 | 0.91 |  |
| -0.90000000000017 | -0.9 | 0.9 |  |
| -0.890000000000169 | -0.89 | 0.89 |  |
| -0.880000000000169 | -0.88 | 0.88 |  |
| -0.870000000000169 | -0.87 | 0.87 |  |
| -0.860000000000169 | -0.86 | 0.86 |  |
| -0.850000000000169 | -0.85 | 0.85 |  |
| -0.840000000000169 | -0.84 | 0.84 |  |
| -0.830000000000169 | -0.83 | 0.83 |  |
| -0.820000000000169 | -0.82 | 0.82 |  |
| -0.810000000000169 | -0.81 | 0.81 |  |
| -0.800000000000169 | -0.8 | 0.8 |  |
| -0.790000000000169 | -0.79 | 0.79 |  |
| -0.780000000000169 | -0.78 | 0.78 |  |
| -0.770000000000169 | -0.77 | 0.77 |  |
| -0.760000000000169 | -0.76 | 0.76 |  |
| -0.750000000000169 | -0.75 | 0.75 |  |
| -0.740000000000169 | -0.74 | 0.74 |  |
| -0.730000000000169 | -0.73 | 0.73 |  |
| -0.720000000000169 | -0.72 | 0.72 |  |
| -0.710000000000169 | -0.71 | 0.71 |  |
| -0.700000000000169 | -0.7 | 0.7 |  |
| -0.690000000000169 | -0.69 | 0.69 |  |
| -0.680000000000169 | -0.68 | 0.68 |  |
| -0.670000000000169 | -0.67 | 0.67 |  |
| -0.660000000000169 | -0.66 | 0.66 |  |
| -0.650000000000169 | -0.65 | 0.65 |  |
| -0.640000000000169 | -0.64 | 0.64 |  |
| -0.630000000000169 | -0.63 | 0.63 |  |
| -0.620000000000169 | -0.62 | 0.62 |  |
| -0.610000000000169 | -0.61 | 0.61 |  |
| -0.600000000000169 | -0.6 | 0.6 |  |
| -0.590000000000169 | -0.59 | 0.59 |  |
| -0.580000000000169 | -0.58 | 0.58 |  |
| -0.570000000000169 | -0.57 | 0.57 |  |
| -0.560000000000169 | -0.56 | 0.56 |  |
| -0.550000000000169 | -0.55 | 0.55 |  |
| -0.540000000000169 | -0.54 | 0.54 |  |
| -0.530000000000169 | -0.53 | 0.53 |  |
| -0.520000000000169 | -0.52 | 0.52 |  |
| -0.510000000000169 | -0.51 | 0.51 |  |
| -0.500000000000169 | -0.5 | 0.5 |  |
| -0.490000000000169 | -0.49 | 0.49 |  |
| -0.480000000000169 | -0.48 | 0.48 |  |
| -0.470000000000169 | -0.47 | 0.47 |  |
| -0.460000000000169 | -0.46 | 0.46 |  |
| -0.450000000000169 | -0.45 | 0.45 |  |
| -0.440000000000169 | -0.44 | 0.44 |  |
| -0.430000000000169 | -0.43 | 0.43 |  |
| -0.420000000000169 | -0.42 | 0.42 |  |
| -0.410000000000169 | -0.41 | 0.41 |  |
| -0.400000000000169 | -0.4 | 0.4 |  |
| -0.390000000000169 | -0.39 | 0.39 |  |
| -0.380000000000169 | -0.38 | 0.38 |  |
| -0.370000000000169 | -0.37 | 0.37 |  |
| -0.360000000000169 | -0.36 | 0.36 |  |
| -0.350000000000169 | -0.35 | 0.35 |  |
| -0.340000000000169 | -0.34 | 0.34 |  |
| -0.330000000000169 | -0.33 | 0.33 |  |
| -0.320000000000169 | -0.32 | 0.32 |  |
| -0.310000000000169 | -0.31 | 0.31 |  |
| -0.300000000000169 | -0.3 | 0.3 |  |
| -0.290000000000169 | -0.29 | 0.29 |  |
| -0.280000000000169 | -0.28 | 0.28 |  |
| -0.270000000000169 | -0.27 | 0.27 |  |
| -0.260000000000169 | -0.26 | 0.26 |  |
| -0.250000000000169 | -0.25 | 0.25 |  |
| -0.240000000000169 | -0.24 | 0.24 |  |
| -0.230000000000169 | -0.23 | 0.23 |  |
| -0.220000000000169 | -0.22 | 0.22 |  |
| -0.210000000000169 | -0.21 | 0.21 |  |
| -0.200000000000169 | -0.2 | 0.2 |  |
| -0.190000000000169 | -0.19 | 0.19 |  |
| -0.180000000000169 | -0.18 | 0.18 |  |
| -0.170000000000169 | -0.17 | 0.17 |  |
| -0.160000000000169 | -0.16 | 0.16 |  |
| -0.150000000000169 | -0.15 | 0.15 |  |
| -0.140000000000169 | -0.14 | 0.14 |  |
| -0.130000000000169 | -0.13 | 0.13 |  |
| -0.120000000000169 | -0.12 | 0.12 |  |
| -0.110000000000169 | -0.11 | 0.11 |  |
| -0.100000000000169 | -0.1 | 0.1 |  |
| -0.0900000000001689 | -0.09 | 0.09 |  |
| -0.0800000000001689 | -0.08 | 0.08 |  |
| -0.0700000000001689 | -0.07 | 0.07 |  |
| -0.0600000000001689 | -0.06 | 0.06 |  |
| -0.0500000000001689 | -0.05 | 0.05 |  |
| -0.0400000000001689 | -0.04 | 0.04 |  |
| -0.0300000000001689 | -0.03 | 0.03 |  |
| -0.0200000000001689 | -0.02 | 0.02 |  |
| -0.0100000000001689 | -0.01 | 0.01 |  |
| -1.6888920817415e-13 | 0 | 0 |  |
| 0.00999999999983111 | 0.01 | -0.01 |  |
| 0.0199999999998311 | 0.02 | -0.02 |  |
| 0.0299999999998311 | 0.03 | -0.03 |  |
| 0.0399999999998311 | 0.04 | -0.04 |  |
| 0.0499999999998311 | 0.05 | -0.05 |  |
| 0.0599999999998311 | 0.06 | -0.06 |  |
| 0.0699999999998311 | 0.07 | -0.07 |  |
| 0.0799999999998311 | 0.08 | -0.08 |  |
| 0.0899999999998311 | 0.09 | -0.09 |  |
| 0.0999999999998311 | 0.1 | -0.1 |  |
| 0.109999999999831 | 0.11 | -0.11 |  |
| 0.119999999999831 | 0.12 | -0.12 |  |
| 0.129999999999831 | 0.13 | -0.13 |  |
| 0.139999999999831 | 0.14 | -0.14 |  |
| 0.149999999999831 | 0.15 | -0.15 |  |
| 0.159999999999831 | 0.16 | -0.16 |  |
| 0.169999999999831 | 0.17 | -0.17 |  |
| 0.179999999999831 | 0.18 | -0.18 |  |
| 0.189999999999831 | 0.19 | -0.19 |  |
| 0.199999999999831 | 0.2 | -0.2 |  |
| 0.209999999999831 | 0.21 | -0.21 |  |
| 0.219999999999831 | 0.22 | -0.22 |  |
| 0.229999999999831 | 0.23 | -0.23 |  |
| 0.239999999999831 | 0.24 | -0.24 |  |
| 0.249999999999831 | 0.25 | -0.25 |  |
| 0.259999999999831 | 0.26 | -0.26 |  |
| 0.269999999999831 | 0.27 | -0.27 |  |
| 0.279999999999831 | 0.28 | -0.28 |  |
| 0.289999999999831 | 0.29 | -0.29 |  |
| 0.299999999999831 | 0.3 | -0.3 |  |
| 0.309999999999831 | 0.31 | -0.31 |  |
| 0.319999999999831 | 0.32 | -0.32 |  |
| 0.329999999999831 | 0.33 | -0.33 |  |
| 0.339999999999831 | 0.34 | -0.34 |  |
| 0.349999999999831 | 0.35 | -0.35 |  |
| 0.359999999999831 | 0.36 | -0.36 |  |
| 0.369999999999831 | 0.37 | -0.37 |  |
| 0.379999999999831 | 0.38 | -0.38 |  |
| 0.389999999999831 | 0.39 | -0.39 |  |
| 0.399999999999831 | 0.4 | -0.4 |  |
| 0.409999999999831 | 0.41 | -0.41 |  |
| 0.419999999999831 | 0.42 | -0.42 |  |
| 0.429999999999831 | 0.43 | -0.43 |  |
| 0.439999999999831 | 0.44 | -0.44 |  |
| 0.449999999999831 | 0.45 | -0.45 |  |
| 0.459999999999831 | 0.46 | -0.46 |  |
| 0.469999999999831 | 0.47 | -0.47 |  |
| 0.479999999999831 | 0.48 | -0.48 |  |
| 0.489999999999831 | 0.49 | -0.49 |  |
| 0.499999999999831 | 0.5 | -0.5 |  |
| 0.509999999999831 | 0.51 | -0.51 |  |
| 0.519999999999831 | 0.52 | -0.52 |  |
| 0.529999999999831 | 0.53 | -0.53 |  |
| 0.539999999999831 | 0.54 | -0.54 |  |
| 0.549999999999831 | 0.55 | -0.55 |  |
| 0.559999999999831 | 0.56 | -0.56 |  |
| 0.569999999999831 | 0.57 | -0.57 |  |
| 0.579999999999831 | 0.58 | -0.58 |  |
| 0.589999999999831 | 0.59 | -0.59 |  |
| 0.599999999999831 | 0.6 | -0.6 |  |
| 0.609999999999831 | 0.61 | -0.61 |  |
| 0.619999999999831 | 0.62 | -0.62 |  |
| 0.629999999999831 | 0.63 | -0.63 |  |
| 0.639999999999831 | 0.64 | -0.64 |  |
| 0.649999999999831 | 0.65 | -0.65 |  |
| 0.659999999999831 | 0.66 | -0.66 |  |
| 0.669999999999831 | 0.67 | -0.67 |  |
| 0.679999999999831 | 0.68 | -0.68 |  |
| 0.689999999999831 | 0.69 | -0.69 |  |
| 0.699999999999831 | 0.7 | -0.7 |  |
| 0.709999999999831 | 0.71 | -0.71 |  |
| 0.719999999999831 | 0.72 | -0.72 |  |
| 0.729999999999831 | 0.73 | -0.73 |  |
| 0.739999999999831 | 0.74 | -0.74 |  |
| 0.749999999999832 | 0.75 | -0.75 |  |
| 0.759999999999832 | 0.76 | -0.76 |  |
| 0.769999999999832 | 0.77 | -0.77 |  |
| 0.779999999999832 | 0.78 | -0.78 |  |
| 0.789999999999832 | 0.79 | -0.79 |  |
| 0.799999999999832 | 0.8 | -0.8 |  |
| 0.809999999999832 | 0.81 | -0.81 |  |
| 0.819999999999832 | 0.82 | -0.82 |  |
| 0.829999999999832 | 0.83 | -0.83 |  |
| 0.839999999999832 | 0.84 | -0.84 |  |
| 0.849999999999832 | 0.85 | -0.85 |  |
| 0.859999999999832 | 0.86 | -0.86 |  |
| 0.869999999999832 | 0.87 | -0.87 |  |
| 0.879999999999832 | 0.88 | -0.88 |  |
| 0.889999999999832 | 0.89 | -0.89 |  |
| 0.899999999999832 | 0.9 | -0.9 |  |
| 0.909999999999832 | 0.91 | -0.91 |  |
| 0.919999999999832 | 0.92 | -0.92 |  |
| 0.929999999999832 | 0.93 | -0.93 |  |
| 0.939999999999832 | 0.94 | -0.94 |  |
| 0.949999999999832 | 0.95 | -0.95 |  |
| 0.959999999999832 | 0.96 | -0.96 |  |
| 0.969999999999832 | 0.97 | -0.97 |  |
| 0.979999999999832 | 0.98 | -0.98 |  |
| 0.989999999999832 | 0.99 | -0.99 |  |
| 0.999999999999832 | 1 | -1 |  |
| 1.009999999999832 | 1.01 | -1.01 |  |
| 1.019999999999832 | 1.02 | -1.02 |  |
| 1.029999999999832 | 1.03 | -1.03 |  |
| 1.039999999999832 | 1.04 | -1.04 |  |
| 1.049999999999832 | 1.05 | -1.05 |  |
| 1.059999999999832 | 1.06 | -1.06 |  |
| 1.069999999999832 | 1.07 | -1.07 |  |
| 1.079999999999832 | 1.08 | -1.08 |  |
| 1.089999999999832 | 1.09 | -1.09 |  |
| 1.099999999999832 | 1.1 | -1.1 |  |
| 1.109999999999832 | 1.11 | -1.11 |  |
| 1.119999999999832 | 1.12 | -1.12 |  |
| 1.129999999999832 | 1.13 | -1.13 |  |
| 1.139999999999832 | 1.14 | -1.14 |  |
| 1.149999999999832 | 1.15 | -1.15 |  |
| 1.159999999999832 | 1.16 | -1.16 |  |
| 1.169999999999832 | 1.17 | -1.17 |  |
| 1.179999999999832 | 1.18 | -1.18 |  |
| 1.189999999999832 | 1.19 | -1.19 |  |
| 1.199999999999832 | 1.2 | -1.2 |  |
| 1.209999999999832 | 1.21 | -1.21 |  |
| 1.219999999999832 | 1.22 | -1.22 |  |
| 1.229999999999832 | 1.23 | -1.23 |  |
| 1.239999999999832 | 1.24 | -1.24 |  |
| 1.249999999999832 | 1.25 | -1.25 |  |
| 1.259999999999832 | 1.26 | -1.26 |  |
| 1.269999999999832 | 1.27 | -1.27 |  |
| 1.279999999999832 | 1.28 | -1.28 |  |
| 1.289999999999832 | 1.29 | -1.29 |  |
| 1.299999999999832 | 1.3 | -1.3 |  |
| 1.309999999999832 | 1.31 | -1.31 |  |
| 1.319999999999832 | 1.32 | -1.32 |  |
| 1.329999999999832 | 1.33 | -1.33 |  |
| 1.339999999999832 | 1.34 | -1.34 |  |
| 1.349999999999832 | 1.35 | -1.35 |  |
| 1.359999999999832 | 1.36 | -1.36 |  |
| 1.369999999999832 | 1.37 | -1.37 |  |
| 1.379999999999832 | 1.38 | -1.38 |  |
| 1.389999999999832 | 1.39 | -1.39 |  |
| 1.399999999999832 | 1.4 | -1.4 |  |
| 1.409999999999832 | 1.41 | -1.41 |  |
| 1.419999999999832 | 1.42 | -1.42 |  |
| 1.429999999999832 | 1.43 | -1.43 |  |
| 1.439999999999832 | 1.44 | -1.44 |  |
| 1.449999999999832 | 1.45 | -1.45 |  |
| 1.459999999999832 | 1.46 | -1.46 |  |
| 1.469999999999832 | 1.47 | -1.47 |  |
| 1.479999999999832 | 1.48 | -1.48 |  |
| 1.489999999999832 | 1.49 | -1.49 |  |
| 1.499999999999832 | 1.5 | -1.5 |  |
| 1.509999999999832 | 1.51 | -1.51 |  |
| 1.519999999999832 | 1.52 | -1.52 |  |
| 1.529999999999832 | 1.53 | -1.53 |  |
| 1.539999999999832 | 1.54 | -1.54 |  |
| 1.549999999999832 | 1.55 | -1.55 |  |
| 1.559999999999832 | 1.56 | -1.56 |  |
| 1.569999999999832 | 1.57 | -1.57 |  |
| 1.579999999999832 | 1.58 | -1.58 |  |
| 1.589999999999832 | 1.59 | -1.59 |  |
| 1.599999999999832 | 1.6 | -1.6 |  |
| 1.609999999999832 | 1.61 | -1.61 |  |
| 1.619999999999832 | 1.62 | -1.62 |  |
| 1.629999999999832 | 1.63 | -1.63 |  |
| 1.639999999999832 | 1.64 | -1.64 |  |
| 1.649999999999832 | 1.65 | -1.65 |  |
| 1.659999999999832 | 1.66 | -1.66 |  |
| 1.669999999999832 | 1.67 | -1.67 |  |
| 1.679999999999832 | 1.68 | -1.68 |  |
| 1.689999999999832 | 1.69 | -1.69 |  |
| 1.699999999999832 | 1.7 | -1.7 |  |
| 1.709999999999832 | 1.71 | -1.71 |  |
| 1.719999999999832 | 1.72 | -1.72 |  |
| 1.729999999999832 | 1.73 | -1.73 |  |
| 1.739999999999832 | 1.74 | -1.74 |  |
| 1.749999999999832 | 1.75 | -1.75 |  |
| 1.759999999999832 | 1.76 | -1.76 |  |
| 1.769999999999832 | 1.77 | -1.77 |  |
| 1.779999999999832 | 1.78 | -1.78 |  |
| 1.789999999999832 | 1.79 | -1.79 |  |
| 1.799999999999832 | 1.8 | -1.8 |  |
| 1.809999999999832 | 1.81 | -1.81 |  |
| 1.819999999999832 | 1.82 | -1.82 |  |
| 1.829999999999832 | 1.83 | -1.83 |  |
| 1.839999999999832 | 1.84 | -1.84 |  |
| 1.849999999999832 | 1.85 | -1.85 |  |
| 1.859999999999832 | 1.86 | -1.86 |  |
| 1.869999999999832 | 1.87 | -1.87 |  |
| 1.879999999999832 | 1.88 | -1.88 |  |
| 1.889999999999832 | 1.89 | -1.89 |  |
| 1.899999999999832 | 1.9 | -1.9 |  |
| 1.909999999999832 | 1.91 | -1.91 |  |
| 1.919999999999832 | 1.92 | -1.92 |  |
| 1.929999999999832 | 1.93 | -1.93 |  |
| 1.939999999999832 | 1.94 | -1.94 |  |
| 1.949999999999833 | 1.95 | -1.95 |  |
| 1.959999999999833 | 1.96 | -1.96 |  |
| 1.969999999999833 | 1.97 | -1.97 |  |
| 1.979999999999833 | 1.98 | -1.98 |  |
| 1.989999999999833 | 1.99 | -1.99 |  |
| 1.999999999999833 | 2 | -2 |  |
| 2.009999999999832 | 2.01 | -2.01 |  |
| 2.019999999999832 | 2.02 | -2.02 |  |
| 2.029999999999832 | 2.03 | -2.03 |  |
| 2.039999999999832 | 2.04 | -2.04 |  |
| 2.049999999999832 | 2.05 | -2.05 |  |
| 2.059999999999831 | 2.06 | -2.06 |  |
| 2.069999999999831 | 2.07 | -2.07 |  |
| 2.079999999999831 | 2.08 | -2.08 |  |
| 2.089999999999831 | 2.09 | -2.09 |  |
| 2.09999999999983 | 2.1 | -2.1 |  |
| 2.10999999999983 | 2.11 | -2.11 |  |
| 2.11999999999983 | 2.12 | -2.12 |  |
| 2.12999999999983 | 2.13 | -2.13 |  |
| 2.13999999999983 | 2.14 | -2.14 |  |
| 2.149999999999829 | 2.15 | -2.15 |  |
| 2.159999999999829 | 2.16 | -2.16 |  |
| 2.169999999999829 | 2.17 | -2.17 |  |
| 2.179999999999829 | 2.18 | -2.18 |  |
| 2.189999999999829 | 2.19 | -2.19 |  |
| 2.199999999999828 | 2.2 | -2.2 |  |
| 2.209999999999828 | 2.21 | -2.21 |  |
| 2.219999999999828 | 2.22 | -2.22 |  |
| 2.229999999999828 | 2.23 | -2.23 |  |
| 2.239999999999827 | 2.24 | -2.24 |  |
| 2.249999999999827 | 2.25 | -2.25 |  |
| 2.259999999999827 | 2.26 | -2.26 |  |
| 2.269999999999827 | 2.27 | -2.27 |  |
| 2.279999999999827 | 2.28 | -2.28 |  |
| 2.289999999999826 | 2.29 | -2.29 |  |
| 2.299999999999826 | 2.3 | -2.3 |  |
| 2.309999999999826 | 2.31 | -2.31 |  |
| 2.319999999999826 | 2.32 | -2.32 |  |
| 2.329999999999825 | 2.33 | -2.33 |  |
| 2.339999999999825 | 2.34 | -2.34 |  |
| 2.349999999999825 | 2.35 | -2.35 |  |
| 2.359999999999825 | 2.36 | -2.36 |  |
| 2.369999999999825 | 2.37 | -2.37 |  |
| 2.379999999999824 | 2.38 | -2.38 |  |
| 2.389999999999824 | 2.39 | -2.39 |  |
| 2.399999999999824 | 2.4 | -2.4 |  |
| 2.409999999999824 | 2.41 | -2.41 |  |
| 2.419999999999824 | 2.42 | -2.42 |  |
| 2.429999999999823 | 2.43 | -2.43 |  |
| 2.439999999999823 | 2.44 | -2.44 |  |
| 2.449999999999823 | 2.45 | -2.45 |  |
| 2.459999999999823 | 2.46 | -2.46 |  |
| 2.469999999999823 | 2.47 | -2.47 |  |
| 2.479999999999822 | 2.48 | -2.48 |  |
| 2.489999999999822 | 2.49 | -2.49 |  |
| 2.499999999999822 | 2.5 | -2.5 |  |
| 2.509999999999822 | 2.51 | -2.51 |  |
| 2.519999999999821 | 2.52 | -2.52 |  |
| 2.529999999999821 | 2.53 | -2.53 |  |
| 2.539999999999821 | 2.54 | -2.54 |  |
| 2.549999999999821 | 2.55 | -2.55 |  |
| 2.559999999999821 | 2.56 | -2.56 |  |
| 2.56999999999982 | 2.57 | -2.57 |  |
| 2.57999999999982 | 2.58 | -2.58 |  |
| 2.58999999999982 | 2.59 | -2.59 |  |
| 2.59999999999982 | 2.6 | -2.6 |  |
| 2.609999999999819 | 2.61 | -2.61 |  |
| 2.619999999999819 | 2.62 | -2.62 |  |
| 2.629999999999819 | 2.63 | -2.63 |  |
| 2.639999999999819 | 2.64 | -2.64 |  |
| 2.649999999999819 | 2.65 | -2.65 |  |
| 2.659999999999818 | 2.66 | -2.66 |  |
| 2.669999999999818 | 2.67 | -2.67 |  |
| 2.679999999999818 | 2.68 | -2.68 |  |
| 2.689999999999818 | 2.69 | -2.69 |  |
| 2.699999999999818 | 2.7 | -2.7 |  |
| 2.709999999999817 | 2.71 | -2.71 |  |
| 2.719999999999817 | 2.72 | -2.72 |  |
| 2.729999999999817 | 2.73 | -2.73 |  |
| 2.739999999999817 | 2.74 | -2.74 |  |
| 2.749999999999817 | 2.75 | -2.75 |  |
| 2.759999999999816 | 2.76 | -2.76 |  |
| 2.769999999999816 | 2.77 | -2.77 |  |
| 2.779999999999816 | 2.78 | -2.78 |  |
| 2.789999999999816 | 2.79 | -2.79 |  |
| 2.799999999999815 | 2.8 | -2.8 |  |
| 2.809999999999815 | 2.81 | -2.81 |  |
| 2.819999999999815 | 2.82 | -2.82 |  |
| 2.829999999999815 | 2.83 | -2.83 |  |
| 2.839999999999815 | 2.84 | -2.84 |  |
| 2.849999999999814 | 2.85 | -2.85 |  |
| 2.859999999999814 | 2.86 | -2.86 |  |
| 2.869999999999814 | 2.87 | -2.87 |  |
| 2.879999999999814 | 2.88 | -2.88 |  |
| 2.889999999999814 | 2.89 | -2.89 |  |
| 2.899999999999813 | 2.9 | -2.9 |  |
| 2.909999999999813 | 2.91 | -2.91 |  |
| 2.919999999999813 | 2.92 | -2.92 |  |
| 2.929999999999813 | 2.93 | -2.93 |  |
| 2.939999999999813 | 2.94 | -2.94 |  |
| 2.949999999999812 | 2.95 | -2.95 |  |
| 2.959999999999812 | 2.96 | -2.96 |  |
| 2.969999999999812 | 2.97 | -2.97 |  |
| 2.979999999999812 | 2.98 | -2.98 |  |
| 2.989999999999811 | 2.99 | -2.99 |  |
| 2.999999999999811 | 3 | -3 |  |
| 3.009999999999811 | 3.01 | -3.01 |  |
| 3.019999999999811 | 3.02 | -3.02 |  |
| 3.029999999999811 | 3.03 | -3.03 |  |
| 3.03999999999981 | 3.04 | -3.04 |  |
| 3.04999999999981 | 3.05 | -3.05 |  |
| 3.05999999999981 | 3.06 | -3.06 |  |
| 3.06999999999981 | 3.07 | -3.07 |  |
| 3.07999999999981 | 3.08 | -3.08 |  |
| 3.089999999999809 | 3.09 | -3.09 |  |
| 3.099999999999809 | 3.1 | -3.1 |  |
| 3.109999999999809 | 3.11 | -3.11 |  |
| 3.119999999999809 | 3.12 | -3.12 |  |
| 3.129999999999808 | 3.13 | -3.13 |  |
| 3.139999999999808 | 3.14 | -3.14 |  |
| 3.149999999999808 | 3.15 | -3.15 |  |
| 3.159999999999808 | 3.16 | -3.16 |  |
| 3.169999999999808 | 3.17 | -3.17 |  |
| 3.179999999999807 | 3.18 | -3.18 |  |
| 3.189999999999807 | 3.19 | -3.19 |  |
| 3.199999999999807 | 3.2 | -3.2 |  |
| 3.209999999999807 | 3.21 | -3.21 |  |
| 3.219999999999807 | 3.22 | -3.22 |  |
| 3.229999999999806 | 3.23 | -3.23 |  |
| 3.239999999999806 | 3.24 | -3.24 |  |
| 3.249999999999806 | 3.25 | -3.25 |  |
| 3.259999999999806 | 3.26 | -3.26 |  |
| 3.269999999999805 | 3.27 | -3.27 |  |
| 3.279999999999805 | 3.28 | -3.28 |  |
| 3.289999999999805 | 3.29 | -3.29 |  |
| 3.299999999999805 | 3.3 | -3.3 |  |
| 3.309999999999805 | 3.31 | -3.31 |  |
| 3.319999999999804 | 3.32 | -3.32 |  |
| 3.329999999999804 | 3.33 | -3.33 |  |
| 3.339999999999804 | 3.34 | -3.34 |  |
| 3.349999999999804 | 3.35 | -3.35 |  |
| 3.359999999999804 | 3.36 | -3.36 |  |
| 3.369999999999803 | 3.37 | -3.37 |  |
| 3.379999999999803 | 3.38 | -3.38 |  |
| 3.389999999999803 | 3.39 | -3.39 |  |
| 3.399999999999803 | 3.4 | -3.4 |  |
| 3.409999999999802 | 3.41 | -3.41 |  |
| 3.419999999999802 | 3.42 | -3.42 |  |
| 3.429999999999802 | 3.43 | -3.43 |  |
| 3.439999999999802 | 3.44 | -3.44 |  |
| 3.449999999999802 | 3.45 | -3.45 |  |
| 3.459999999999801 | 3.46 | -3.46 |  |
| 3.469999999999801 | 3.47 | -3.47 |  |
| 3.479999999999801 | 3.48 | -3.48 |  |
| 3.489999999999801 | 3.49 | -3.49 |  |
| 3.499999999999801 | 3.5 | -3.5 |  |
| 3.5099999999998 | 3.51 | -3.51 |  |
| 3.5199999999998 | 3.52 | -3.52 |  |
| 3.5299999999998 | 3.53 | -3.53 |  |
| 3.5399999999998 | 3.54 | -3.54 |  |
| 3.5499999999998 | 3.55 | -3.55 |  |
| 3.559999999999799 | 3.56 | -3.56 |  |
| 3.569999999999799 | 3.57 | -3.57 |  |
| 3.579999999999799 | 3.58 | -3.58 |  |
| 3.589999999999799 | 3.59 | -3.59 |  |
| 3.599999999999798 | 3.6 | -3.6 |  |
| 3.609999999999798 | 3.61 | -3.61 |  |
| 3.619999999999798 | 3.62 | -3.62 |  |
| 3.629999999999798 | 3.63 | -3.63 |  |
| 3.639999999999798 | 3.64 | -3.64 |  |
| 3.649999999999797 | 3.65 | -3.65 |  |
| 3.659999999999797 | 3.66 | -3.66 |  |
| 3.669999999999797 | 3.67 | -3.67 |  |
| 3.679999999999797 | 3.68 | -3.68 |  |
| 3.689999999999796 | 3.69 | -3.69 |  |
| 3.699999999999796 | 3.7 | -3.7 |  |
| 3.709999999999796 | 3.71 | -3.71 |  |
| 3.719999999999796 | 3.72 | -3.72 |  |
| 3.729999999999796 | 3.73 | -3.73 |  |
| 3.739999999999795 | 3.74 | -3.74 |  |
| 3.749999999999795 | 3.75 | -3.75 |  |
| 3.759999999999795 | 3.76 | -3.76 |  |
| 3.769999999999795 | 3.77 | -3.77 |  |
| 3.779999999999795 | 3.78 | -3.78 |  |
| 3.789999999999794 | 3.79 | -3.79 |  |
| 3.799999999999794 | 3.8 | -3.8 |  |
| 3.809999999999794 | 3.81 | -3.81 |  |
| 3.819999999999794 | 3.82 | -3.82 |  |
| 3.829999999999794 | 3.83 | -3.83 |  |
| 3.839999999999793 | 3.84 | -3.84 |  |
| 3.849999999999793 | 3.85 | -3.85 |  |
| 3.859999999999793 | 3.86 | -3.86 |  |
| 3.869999999999793 | 3.87 | -3.87 |  |
| 3.879999999999792 | 3.88 | -3.88 |  |
| 3.889999999999792 | 3.89 | -3.89 |  |
| 3.899999999999792 | 3.9 | -3.9 |  |
| 3.909999999999792 | 3.91 | -3.91 |  |
| 3.919999999999792 | 3.92 | -3.92 |  |
| 3.929999999999791 | 3.93 | -3.93 |  |
| 3.939999999999791 | 3.94 | -3.94 |  |
| 3.949999999999791 | 3.95 | -3.95 |  |
| 3.959999999999791 | 3.96 | -3.96 |  |
| 3.969999999999791 | 3.97 | -3.97 |  |
| 3.97999999999979 | 3.98 | -3.98 |  |
| 3.98999999999979 | 3.99 | -3.99 |  |
| 3.99999999999979 | 4 | -4 |  |
| 4.00999999999979 | 4.01 | -4.01 |  |
| 4.01999999999979 | 4.02 | -4.02 |  |
| 4.02999999999979 | 4.03 | -4.03 |  |
| 4.03999999999979 | 4.04 | -4.04 |  |
| 4.04999999999979 | 4.05 | -4.05 |  |
| 4.05999999999979 | 4.06 | -4.06 |  |
| 4.069999999999789 | 4.07 | -4.07 |  |
| 4.079999999999788 | 4.08 | -4.08 |  |
| 4.089999999999788 | 4.09 | -4.09 |  |
| 4.099999999999788 | 4.1 | -4.1 |  |
| 4.109999999999788 | 4.11 | -4.11 |  |
| 4.119999999999788 | 4.12 | -4.12 |  |
| 4.129999999999788 | 4.13 | -4.13 |  |
| 4.139999999999787 | 4.14 | -4.14 |  |
| 4.149999999999787 | 4.15 | -4.15 |  |
| 4.159999999999787 | 4.16 | -4.16 |  |
| 4.169999999999787 | 4.17 | -4.17 |  |
| 4.179999999999786 | 4.18 | -4.18 |  |
| 4.189999999999786 | 4.19 | -4.19 |  |
| 4.199999999999786 | 4.2 | -4.2 |  |
| 4.209999999999785 | 4.21 | -4.21 |  |
| 4.219999999999785 | 4.22 | -4.22 |  |
| 4.229999999999785 | 4.23 | -4.23 |  |
| 4.239999999999785 | 4.24 | -4.24 |  |
| 4.249999999999785 | 4.25 | -4.25 |  |
| 4.259999999999784 | 4.26 | -4.26 |  |
| 4.269999999999784 | 4.27 | -4.27 |  |
| 4.279999999999784 | 4.28 | -4.28 |  |
| 4.289999999999784 | 4.29 | -4.29 |  |
| 4.299999999999784 | 4.3 | -4.3 |  |
| 4.309999999999784 | 4.31 | -4.31 |  |
| 4.319999999999784 | 4.32 | -4.32 |  |
| 4.329999999999783 | 4.33 | -4.33 |  |
| 4.339999999999783 | 4.34 | -4.34 |  |
| 4.349999999999783 | 4.35 | -4.35 |  |
| 4.359999999999783 | 4.36 | -4.36 |  |
| 4.369999999999782 | 4.37 | -4.37 |  |
| 4.379999999999782 | 4.38 | -4.38 |  |
| 4.389999999999782 | 4.39 | -4.39 |  |
| 4.399999999999782 | 4.4 | -4.4 |  |
| 4.409999999999781 | 4.41 | -4.41 |  |
| 4.419999999999781 | 4.42 | -4.42 |  |
| 4.429999999999781 | 4.43 | -4.43 |  |
| 4.43999999999978 | 4.44 | -4.44 |  |
| 4.44999999999978 | 4.45 | -4.45 |  |
| 4.45999999999978 | 4.46 | -4.46 |  |
| 4.46999999999978 | 4.47 | -4.47 |  |
| 4.47999999999978 | 4.48 | -4.48 |  |
| 4.48999999999978 | 4.49 | -4.49 |  |
| 4.49999999999978 | 4.5 | -4.5 |  |
| 4.50999999999978 | 4.51 | -4.51 |  |
| 4.51999999999978 | 4.52 | -4.52 |  |
| 4.52999999999978 | 4.53 | -4.53 |  |
| 4.539999999999778 | 4.54 | -4.54 |  |
| 4.549999999999778 | 4.55 | -4.55 |  |
| 4.559999999999778 | 4.56 | -4.56 |  |
| 4.569999999999778 | 4.57 | -4.57 |  |
| 4.579999999999778 | 4.58 | -4.58 |  |
| 4.589999999999777 | 4.59 | -4.59 |  |
| 4.599999999999777 | 4.6 | -4.6 |  |
| 4.609999999999777 | 4.61 | -4.61 |  |
| 4.619999999999777 | 4.62 | -4.62 |  |
| 4.629999999999777 | 4.63 | -4.63 |  |
| 4.639999999999776 | 4.64 | -4.64 |  |
| 4.649999999999776 | 4.65 | -4.65 |  |
| 4.659999999999776 | 4.66 | -4.66 |  |
| 4.669999999999776 | 4.67 | -4.67 |  |
| 4.679999999999775 | 4.68 | -4.68 |  |
| 4.689999999999775 | 4.69 | -4.69 |  |
| 4.699999999999775 | 4.7 | -4.7 |  |
| 4.709999999999775 | 4.71 | -4.71 |  |
| 4.719999999999774 | 4.72 | -4.72 |  |
| 4.729999999999774 | 4.73 | -4.73 |  |
| 4.739999999999774 | 4.74 | -4.74 |  |
| 4.749999999999774 | 4.75 | -4.75 |  |
| 4.759999999999774 | 4.76 | -4.76 |  |
| 4.769999999999774 | 4.77 | -4.77 |  |
| 4.779999999999773 | 4.78 | -4.78 |  |
| 4.789999999999773 | 4.79 | -4.79 |  |
| 4.799999999999773 | 4.8 | -4.8 |  |
| 4.809999999999773 | 4.81 | -4.81 |  |
| 4.819999999999773 | 4.82 | -4.82 |  |
| 4.829999999999773 | 4.83 | -4.83 |  |
| 4.839999999999772 | 4.84 | -4.84 |  |
| 4.849999999999772 | 4.85 | -4.85 |  |
| 4.859999999999772 | 4.86 | -4.86 |  |
| 4.869999999999772 | 4.87 | -4.87 |  |
| 4.879999999999771 | 4.88 | -4.88 |  |
| 4.889999999999771 | 4.89 | -4.89 |  |
| 4.899999999999771 | 4.9 | -4.9 |  |
| 4.90999999999977 | 4.91 | -4.91 |  |
| 4.91999999999977 | 4.92 | -4.92 |  |
| 4.92999999999977 | 4.93 | -4.93 |  |
| 4.93999999999977 | 4.94 | -4.94 |  |
| 4.94999999999977 | 4.95 | -4.95 |  |
| 4.95999999999977 | 4.96 | -4.96 |  |
| 4.96999999999977 | 4.97 | -4.97 |  |
| 4.97999999999977 | 4.98 | -4.98 |  |
| 4.98999999999977 | 4.99 | -4.99 |  |
| 4.99999999999977 | 5 | -5 |  |
| 5.009999999999768 | 5.01 | -5.01 |  |
| 5.019999999999768 | 5.02 | -5.02 |  |
| 5.029999999999768 | 5.03 | -5.03 |  |
| 5.039999999999768 | 5.04 | -5.04 |  |
| 5.049999999999767 | 5.05 | -5.05 |  |
| 5.059999999999767 | 5.06 | -5.06 |  |
| 5.069999999999767 | 5.07 | -5.07 |  |
| 5.079999999999767 | 5.08 | -5.08 |  |
| 5.089999999999767 | 5.09 | -5.09 |  |
| 5.099999999999766 | 5.1 | -5.1 |  |
| 5.109999999999766 | 5.11 | -5.11 |  |
| 5.119999999999766 | 5.12 | -5.12 |  |
| 5.129999999999766 | 5.13 | -5.13 |  |
| 5.139999999999766 | 5.14 | -5.14 |  |
| 5.149999999999765 | 5.15 | -5.15 |  |
| 5.159999999999765 | 5.16 | -5.16 |  |
| 5.169999999999765 | 5.17 | -5.17 |  |
| 5.179999999999765 | 5.18 | -5.18 |  |
| 5.189999999999764 | 5.19 | -5.19 |  |
| 5.199999999999764 | 5.2 | -5.2 |  |
| 5.209999999999764 | 5.21 | -5.21 |  |
| 5.219999999999764 | 5.22 | -5.22 |  |
| 5.229999999999764 | 5.23 | -5.23 |  |
| 5.239999999999763 | 5.24 | -5.24 |  |
| 5.249999999999763 | 5.25 | -5.25 |  |
| 5.259999999999763 | 5.26 | -5.26 |  |
| 5.269999999999763 | 5.27 | -5.27 |  |
| 5.279999999999763 | 5.28 | -5.28 |  |
| 5.289999999999762 | 5.29 | -5.29 |  |
| 5.299999999999762 | 5.3 | -5.3 |  |
| 5.309999999999762 | 5.31 | -5.31 |  |
| 5.319999999999762 | 5.32 | -5.32 |  |
| 5.329999999999762 | 5.33 | -5.33 |  |
| 5.339999999999761 | 5.34 | -5.34 |  |
| 5.349999999999761 | 5.35 | -5.35 |  |
| 5.359999999999761 | 5.36 | -5.36 |  |
| 5.369999999999761 | 5.37 | -5.37 |  |
| 5.37999999999976 | 5.38 | -5.38 |  |
| 5.38999999999976 | 5.39 | -5.39 |  |
| 5.39999999999976 | 5.4 | -5.4 |  |
| 5.40999999999976 | 5.41 | -5.41 |  |
| 5.41999999999976 | 5.42 | -5.42 |  |
| 5.42999999999976 | 5.43 | -5.43 |  |
| 5.43999999999976 | 5.44 | -5.44 |  |
| 5.44999999999976 | 5.45 | -5.45 |  |
| 5.45999999999976 | 5.46 | -5.46 |  |
| 5.46999999999976 | 5.47 | -5.47 |  |
| 5.479999999999758 | 5.48 | -5.48 |  |
| 5.489999999999758 | 5.49 | -5.49 |  |
| 5.499999999999758 | 5.5 | -5.5 |  |
| 5.509999999999758 | 5.51 | -5.51 |  |
| 5.519999999999758 | 5.52 | -5.52 |  |
| 5.529999999999758 | 5.53 | -5.53 |  |
| 5.539999999999757 | 5.54 | -5.54 |  |
| 5.549999999999757 | 5.55 | -5.55 |  |
| 5.559999999999757 | 5.56 | -5.56 |  |
| 5.569999999999757 | 5.57 | -5.57 |  |
| 5.579999999999756 | 5.58 | -5.58 |  |
| 5.589999999999756 | 5.59 | -5.59 |  |
| 5.599999999999756 | 5.6 | -5.6 |  |
| 5.609999999999756 | 5.61 | -5.61 |  |
| 5.619999999999756 | 5.62 | -5.62 |  |
| 5.629999999999756 | 5.63 | -5.63 |  |
| 5.639999999999755 | 5.64 | -5.64 |  |
| 5.649999999999755 | 5.65 | -5.65 |  |
| 5.659999999999755 | 5.66 | -5.66 |  |
| 5.669999999999755 | 5.67 | -5.67 |  |
| 5.679999999999754 | 5.68 | -5.68 |  |
| 5.689999999999754 | 5.69 | -5.69 |  |
| 5.699999999999754 | 5.7 | -5.7 |  |
| 5.709999999999754 | 5.71 | -5.71 |  |
| 5.719999999999754 | 5.72 | -5.72 |  |
| 5.729999999999753 | 5.73 | -5.73 |  |
| 5.739999999999753 | 5.74 | -5.74 |  |
| 5.749999999999753 | 5.75 | -5.75 |  |
| 5.759999999999753 | 5.76 | -5.76 |  |
| 5.769999999999753 | 5.77 | -5.77 |  |
| 5.779999999999752 | 5.78 | -5.78 |  |
| 5.789999999999752 | 5.79 | -5.79 |  |
| 5.799999999999752 | 5.8 | -5.8 |  |
| 5.809999999999752 | 5.81 | -5.81 |  |
| 5.819999999999752 | 5.82 | -5.82 |  |
| 5.829999999999751 | 5.83 | -5.83 |  |
| 5.839999999999751 | 5.84 | -5.84 |  |
| 5.849999999999751 | 5.85 | -5.85 |  |
| 5.859999999999751 | 5.86 | -5.86 |  |
| 5.86999999999975 | 5.87 | -5.87 |  |
| 5.87999999999975 | 5.88 | -5.88 |  |
| 5.88999999999975 | 5.89 | -5.89 |  |
| 5.89999999999975 | 5.9 | -5.9 |  |
| 5.90999999999975 | 5.91 | -5.91 |  |
| 5.91999999999975 | 5.92 | -5.92 |  |
| 5.92999999999975 | 5.93 | -5.93 |  |
| 5.93999999999975 | 5.94 | -5.94 |  |
| 5.949999999999748 | 5.95 | -5.95 |  |
| 5.959999999999748 | 5.96 | -5.96 |  |
| 5.969999999999748 | 5.97 | -5.97 |  |
| 5.979999999999748 | 5.98 | -5.98 |  |
| 5.989999999999747 | 5.99 | -5.99 |  |
| 5.999999999999747 | 6 | -6 |  |
| 6.009999999999747 | 6.01 | -6.01 |  |
| 6.019999999999747 | 6.02 | -6.02 |  |
| 6.029999999999747 | 6.03 | -6.03 |  |
| 6.039999999999746 | 6.04 | -6.04 |  |
| 6.049999999999746 | 6.05 | -6.05 |  |
| 6.059999999999746 | 6.06 | -6.06 |  |
| 6.069999999999746 | 6.07 | -6.07 |  |
| 6.079999999999746 | 6.08 | -6.08 |  |
| 6.089999999999745 | 6.09 | -6.09 |  |
| 6.099999999999745 | 6.1 | -6.1 |  |
| 6.109999999999745 | 6.11 | -6.11 |  |
| 6.119999999999745 | 6.12 | -6.12 |  |
| 6.129999999999745 | 6.13 | -6.13 |  |
| 6.139999999999744 | 6.14 | -6.14 |  |
| 6.149999999999744 | 6.15 | -6.15 |  |
| 6.159999999999744 | 6.16 | -6.16 |  |
| 6.169999999999744 | 6.17 | -6.17 |  |
| 6.179999999999744 | 6.18 | -6.18 |  |
| 6.189999999999744 | 6.19 | -6.19 |  |
| 6.199999999999743 | 6.2 | -6.2 |  |
| 6.209999999999743 | 6.21 | -6.21 |  |
| 6.219999999999743 | 6.22 | -6.22 |  |
| 6.229999999999743 | 6.23 | -6.23 |  |
| 6.239999999999742 | 6.24 | -6.24 |  |
| 6.249999999999742 | 6.25 | -6.25 |  |
| 6.259999999999742 | 6.26 | -6.26 |  |
| 6.269999999999742 | 6.27 | -6.27 |  |
| 6.279999999999741 | 6.28 | -6.28 |  |
| 6.289999999999741 | 6.29 | -6.29 |  |
| 6.299999999999741 | 6.3 | -6.3 |  |
| 6.309999999999741 | 6.31 | -6.31 |  |
| 6.319999999999741 | 6.32 | -6.32 |  |
| 6.329999999999741 | 6.33 | -6.33 |  |
| 6.33999999999974 | 6.34 | -6.34 |  |
| 6.34999999999974 | 6.35 | -6.35 |  |
| 6.35999999999974 | 6.36 | -6.36 |  |
| 6.36999999999974 | 6.37 | -6.37 |  |
| 6.37999999999974 | 6.38 | -6.38 |  |
| 6.38999999999974 | 6.39 | -6.39 |  |
| 6.39999999999974 | 6.4 | -6.4 |  |
| 6.409999999999738 | 6.41 | -6.41 |  |
| 6.419999999999738 | 6.42 | -6.42 |  |
| 6.429999999999738 | 6.43 | -6.43 |  |
| 6.439999999999738 | 6.44 | -6.44 |  |
| 6.449999999999738 | 6.45 | -6.45 |  |
| 6.459999999999737 | 6.46 | -6.46 |  |
| 6.469999999999737 | 6.47 | -6.47 |  |
| 6.479999999999737 | 6.48 | -6.48 |  |
| 6.489999999999737 | 6.49 | -6.49 |  |
| 6.499999999999737 | 6.5 | -6.5 |  |
| 6.509999999999736 | 6.51 | -6.51 |  |
| 6.519999999999736 | 6.52 | -6.52 |  |
| 6.529999999999736 | 6.53 | -6.53 |  |
| 6.539999999999736 | 6.54 | -6.54 |  |
| 6.549999999999736 | 6.55 | -6.55 |  |
| 6.559999999999735 | 6.56 | -6.56 |  |
| 6.569999999999735 | 6.57 | -6.57 |  |
| 6.579999999999735 | 6.58 | -6.58 |  |
| 6.589999999999735 | 6.59 | -6.59 |  |
| 6.599999999999734 | 6.6 | -6.6 |  |
| 6.609999999999734 | 6.61 | -6.61 |  |
| 6.619999999999734 | 6.62 | -6.62 |  |
| 6.629999999999734 | 6.63 | -6.63 |  |
| 6.639999999999734 | 6.64 | -6.64 |  |
| 6.649999999999734 | 6.65 | -6.65 |  |
| 6.659999999999734 | 6.66 | -6.66 |  |
| 6.669999999999733 | 6.67 | -6.67 |  |
| 6.679999999999733 | 6.68 | -6.68 |  |
| 6.689999999999733 | 6.69 | -6.69 |  |
| 6.699999999999733 | 6.7 | -6.7 |  |
| 6.709999999999732 | 6.71 | -6.71 |  |
| 6.719999999999732 | 6.72 | -6.72 |  |
| 6.729999999999732 | 6.73 | -6.73 |  |
| 6.739999999999731 | 6.74 | -6.74 |  |
| 6.749999999999731 | 6.75 | -6.75 |  |
| 6.759999999999731 | 6.76 | -6.76 |  |
| 6.769999999999731 | 6.77 | -6.77 |  |
| 6.77999999999973 | 6.78 | -6.78 |  |
| 6.78999999999973 | 6.79 | -6.79 |  |
| 6.79999999999973 | 6.8 | -6.8 |  |
| 6.80999999999973 | 6.81 | -6.81 |  |
| 6.81999999999973 | 6.82 | -6.82 |  |
| 6.82999999999973 | 6.83 | -6.83 |  |
| 6.83999999999973 | 6.84 | -6.84 |  |
| 6.84999999999973 | 6.85 | -6.85 |  |
| 6.85999999999973 | 6.86 | -6.86 |  |
| 6.86999999999973 | 6.87 | -6.87 |  |
| 6.879999999999728 | 6.88 | -6.88 |  |
| 6.889999999999728 | 6.89 | -6.89 |  |
| 6.899999999999728 | 6.9 | -6.9 |  |
| 6.909999999999728 | 6.91 | -6.91 |  |
| 6.919999999999728 | 6.92 | -6.92 |  |
| 6.929999999999727 | 6.93 | -6.93 |  |
| 6.939999999999727 | 6.94 | -6.94 |  |
| 6.949999999999727 | 6.95 | -6.95 |  |
| 6.959999999999727 | 6.96 | -6.96 |  |
| 6.969999999999727 | 6.97 | -6.97 |  |
| 6.979999999999726 | 6.98 | -6.98 |  |
| 6.989999999999726 | 6.99 | -6.99 |  |
| 6.999999999999726 | 7 | -7 |  |
| 7.009999999999726 | 7.01 | -7.01 |  |
| 7.019999999999726 | 7.02 | -7.02 |  |
| 7.029999999999725 | 7.03 | -7.03 |  |
| 7.039999999999725 | 7.04 | -7.04 |  |
| 7.049999999999725 | 7.05 | -7.05 |  |
| 7.059999999999725 | 7.06 | -7.06 |  |
| 7.069999999999724 | 7.07 | -7.07 |  |
| 7.079999999999724 | 7.08 | -7.08 |  |
| 7.089999999999724 | 7.09 | -7.09 |  |
| 7.099999999999724 | 7.1 | -7.1 |  |
| 7.109999999999724 | 7.11 | -7.11 |  |
| 7.119999999999724 | 7.12 | -7.12 |  |
| 7.129999999999724 | 7.13 | -7.13 |  |
| 7.139999999999723 | 7.14 | -7.14 |  |
| 7.149999999999723 | 7.15 | -7.15 |  |
| 7.159999999999723 | 7.16 | -7.16 |  |
| 7.169999999999723 | 7.17 | -7.17 |  |
| 7.179999999999722 | 7.18 | -7.18 |  |
| 7.189999999999722 | 7.19 | -7.19 |  |
| 7.199999999999722 | 7.2 | -7.2 |  |
| 7.209999999999721 | 7.21 | -7.21 |  |
| 7.219999999999721 | 7.22 | -7.22 |  |
| 7.229999999999721 | 7.23 | -7.23 |  |
| 7.23999999999972 | 7.24 | -7.24 |  |
| 7.24999999999972 | 7.25 | -7.25 |  |
| 7.25999999999972 | 7.26 | -7.26 |  |
| 7.26999999999972 | 7.27 | -7.27 |  |
| 7.27999999999972 | 7.28 | -7.28 |  |
| 7.28999999999972 | 7.29 | -7.29 |  |
| 7.29999999999972 | 7.3 | -7.3 |  |
| 7.30999999999972 | 7.31 | -7.31 |  |
| 7.31999999999972 | 7.32 | -7.32 |  |
| 7.329999999999719 | 7.33 | -7.33 |  |
| 7.33999999999972 | 7.34 | -7.34 |  |
| 7.349999999999719 | 7.35 | -7.35 |  |
| 7.359999999999719 | 7.36 | -7.36 |  |
| 7.369999999999718 | 7.37 | -7.37 |  |
| 7.379999999999718 | 7.38 | -7.38 |  |
| 7.389999999999718 | 7.39 | -7.39 |  |
| 7.399999999999718 | 7.4 | -7.4 |  |
| 7.409999999999717 | 7.41 | -7.41 |  |
| 7.419999999999717 | 7.42 | -7.42 |  |
| 7.429999999999717 | 7.43 | -7.43 |  |
| 7.439999999999717 | 7.44 | -7.44 |  |
| 7.449999999999716 | 7.45 | -7.45 |  |
| 7.459999999999716 | 7.46 | -7.46 |  |
| 7.469999999999716 | 7.47 | -7.47 |  |
| 7.479999999999716 | 7.48 | -7.48 |  |
| 7.489999999999715 | 7.49 | -7.49 |  |
| 7.499999999999715 | 7.5 | -7.5 |  |
| 7.509999999999715 | 7.51 | -7.51 |  |
| 7.519999999999715 | 7.52 | -7.52 |  |
| 7.529999999999715 | 7.53 | -7.53 |  |
| 7.539999999999714 | 7.54 | -7.54 |  |
| 7.549999999999714 | 7.55 | -7.55 |  |
| 7.559999999999714 | 7.56 | -7.56 |  |
| 7.569999999999714 | 7.57 | -7.57 |  |
| 7.579999999999714 | 7.58 | -7.58 |  |
| 7.589999999999714 | 7.59 | -7.59 |  |
| 7.599999999999714 | 7.6 | -7.6 |  |
| 7.609999999999713 | 7.61 | -7.61 |  |
| 7.619999999999713 | 7.62 | -7.62 |  |
| 7.629999999999713 | 7.63 | -7.63 |  |
| 7.639999999999713 | 7.64 | -7.64 |  |
| 7.649999999999712 | 7.65 | -7.65 |  |
| 7.659999999999712 | 7.66 | -7.66 |  |
| 7.669999999999712 | 7.67 | -7.67 |  |
| 7.679999999999712 | 7.68 | -7.68 |  |
| 7.689999999999712 | 7.69 | -7.69 |  |
| 7.699999999999711 | 7.7 | -7.7 |  |
| 7.709999999999711 | 7.71 | -7.71 |  |
| 7.719999999999711 | 7.72 | -7.72 |  |
| 7.729999999999711 | 7.73 | -7.73 |  |
| 7.73999999999971 | 7.74 | -7.74 |  |
| 7.74999999999971 | 7.75 | -7.75 |  |
| 7.75999999999971 | 7.76 | -7.76 |  |
| 7.76999999999971 | 7.77 | -7.77 |  |
| 7.77999999999971 | 7.78 | -7.78 |  |
| 7.78999999999971 | 7.79 | -7.79 |  |
| 7.79999999999971 | 7.8 | -7.8 |  |
| 7.80999999999971 | 7.81 | -7.81 |  |
| 7.819999999999709 | 7.82 | -7.82 |  |
| 7.829999999999709 | 7.83 | -7.83 |  |
| 7.839999999999708 | 7.84 | -7.84 |  |
| 7.849999999999708 | 7.85 | -7.85 |  |
| 7.859999999999708 | 7.86 | -7.86 |  |
| 7.869999999999708 | 7.87 | -7.87 |  |
| 7.879999999999707 | 7.88 | -7.88 |  |
| 7.889999999999707 | 7.89 | -7.89 |  |
| 7.899999999999707 | 7.9 | -7.9 |  |
| 7.909999999999707 | 7.91 | -7.91 |  |
| 7.919999999999706 | 7.92 | -7.92 |  |
| 7.929999999999706 | 7.93 | -7.93 |  |
| 7.939999999999706 | 7.94 | -7.94 |  |
| 7.949999999999706 | 7.95 | -7.95 |  |
| 7.959999999999705 | 7.96 | -7.96 |  |
| 7.969999999999705 | 7.97 | -7.97 |  |
| 7.979999999999705 | 7.98 | -7.98 |  |
| 7.989999999999705 | 7.99 | -7.99 |  |
| 7.999999999999705 | 8 | -8 |  |
| 8.009999999999703 | 8.01 | -8.01 |  |
| 8.019999999999705 | 8.02 | -8.02 |  |
| 8.029999999999704 | 8.03 | -8.03 |  |
| 8.039999999999704 | 8.04 | -8.04 |  |
| 8.049999999999704 | 8.05 | -8.05 |  |
| 8.059999999999704 | 8.06 | -8.06 |  |
| 8.069999999999704 | 8.07 | -8.07 |  |
| 8.079999999999703 | 8.08 | -8.08 |  |
| 8.089999999999703 | 8.09 | -8.09 |  |
| 8.099999999999701 | 8.1 | -8.1 |  |
| 8.109999999999703 | 8.11 | -8.11 |  |
| 8.119999999999703 | 8.12 | -8.12 |  |
| 8.129999999999702 | 8.13 | -8.13 |  |
| 8.139999999999702 | 8.14 | -8.14 |  |
| 8.1499999999997 | 8.15 | -8.15 |  |
| 8.1599999999997 | 8.16 | -8.16 |  |
| 8.1699999999997 | 8.17 | -8.17 |  |
| 8.1799999999997 | 8.18 | -8.18 |  |
| 8.1899999999997 | 8.19 | -8.19 |  |
| 8.1999999999997 | 8.2 | -8.2 |  |
| 8.2099999999997 | 8.21 | -8.21 |  |
| 8.2199999999997 | 8.22 | -8.22 |  |
| 8.2299999999997 | 8.23 | -8.23 |  |
| 8.2399999999997 | 8.24 | -8.24 |  |
| 8.2499999999997 | 8.25 | -8.25 |  |
| 8.2599999999997 | 8.26 | -8.26 |  |
| 8.2699999999997 | 8.27 | -8.27 |  |
| 8.2799999999997 | 8.28 | -8.28 |  |
| 8.289999999999697 | 8.29 | -8.29 |  |
| 8.299999999999699 | 8.3 | -8.3 |  |
| 8.309999999999699 | 8.31 | -8.31 |  |
| 8.319999999999698 | 8.32 | -8.32 |  |
| 8.329999999999698 | 8.33 | -8.33 |  |
| 8.339999999999698 | 8.34 | -8.34 |  |
| 8.349999999999698 | 8.35 | -8.35 |  |
| 8.359999999999697 | 8.36 | -8.36 |  |
| 8.369999999999697 | 8.37 | -8.37 |  |
| 8.379999999999695 | 8.38 | -8.38 |  |
| 8.389999999999697 | 8.39 | -8.39 |  |
| 8.399999999999697 | 8.4 | -8.4 |  |
| 8.409999999999696 | 8.41 | -8.41 |  |
| 8.419999999999696 | 8.42 | -8.42 |  |
| 8.429999999999694 | 8.43 | -8.43 |  |
| 8.439999999999696 | 8.44 | -8.44 |  |
| 8.449999999999696 | 8.45 | -8.45 |  |
| 8.459999999999695 | 8.46 | -8.46 |  |
| 8.469999999999695 | 8.47 | -8.47 |  |
| 8.479999999999693 | 8.48 | -8.48 |  |
| 8.489999999999695 | 8.49 | -8.49 |  |
| 8.499999999999694 | 8.5 | -8.5 |  |
| 8.509999999999694 | 8.51 | -8.51 |  |
| 8.519999999999694 | 8.52 | -8.52 |  |
| 8.529999999999694 | 8.53 | -8.53 |  |
| 8.539999999999694 | 8.54 | -8.54 |  |
| 8.549999999999693 | 8.55 | -8.55 |  |
| 8.55999999999969 | 8.56 | -8.56 |  |
| 8.56999999999969 | 8.57 | -8.57 |  |
| 8.57999999999969 | 8.58 | -8.58 |  |
| 8.58999999999969 | 8.59 | -8.59 |  |
| 8.59999999999969 | 8.6 | -8.6 |  |
| 8.60999999999969 | 8.61 | -8.61 |  |
| 8.61999999999969 | 8.62 | -8.62 |  |
| 8.62999999999969 | 8.63 | -8.63 |  |
| 8.63999999999969 | 8.64 | -8.64 |  |
| 8.64999999999969 | 8.65 | -8.65 |  |
| 8.65999999999969 | 8.66 | -8.66 |  |
| 8.66999999999969 | 8.67 | -8.67 |  |
| 8.67999999999969 | 8.68 | -8.68 |  |
| 8.68999999999969 | 8.69 | -8.69 |  |
| 8.69999999999969 | 8.7 | -8.7 |  |
| 8.70999999999969 | 8.71 | -8.71 |  |
| 8.71999999999969 | 8.72 | -8.72 |  |
| 8.72999999999969 | 8.73 | -8.73 |  |
| 8.73999999999969 | 8.74 | -8.74 |  |
| 8.74999999999969 | 8.75 | -8.75 |  |
| 8.759999999999687 | 8.76 | -8.76 |  |
| 8.769999999999689 | 8.77 | -8.77 |  |
| 8.779999999999688 | 8.78 | -8.78 |  |
| 8.789999999999688 | 8.79 | -8.79 |  |
| 8.799999999999686 | 8.8 | -8.8 |  |
| 8.809999999999688 | 8.81 | -8.81 |  |
| 8.819999999999688 | 8.82 | -8.82 |  |
| 8.829999999999687 | 8.83 | -8.83 |  |
| 8.839999999999687 | 8.84 | -8.84 |  |
| 8.849999999999685 | 8.85 | -8.85 |  |
| 8.859999999999687 | 8.86 | -8.86 |  |
| 8.869999999999687 | 8.87 | -8.87 |  |
| 8.879999999999686 | 8.88 | -8.88 |  |
| 8.889999999999686 | 8.89 | -8.89 |  |
| 8.899999999999684 | 8.9 | -8.9 |  |
| 8.909999999999686 | 8.91 | -8.91 |  |
| 8.919999999999686 | 8.92 | -8.92 |  |
| 8.929999999999685 | 8.93 | -8.93 |  |
| 8.939999999999685 | 8.94 | -8.94 |  |
| 8.949999999999685 | 8.95 | -8.95 |  |
| 8.959999999999685 | 8.96 | -8.96 |  |
| 8.969999999999684 | 8.97 | -8.97 |  |
| 8.979999999999684 | 8.98 | -8.98 |  |
| 8.989999999999682 | 8.99 | -8.99 |  |
| 8.999999999999684 | 9 | -9 |  |
| 9.009999999999684 | 9.01 | -9.01 |  |
| 9.019999999999683 | 9.02 | -9.02 |  |
| 9.029999999999683 | 9.03 | -9.03 |  |
| 9.039999999999681 | 9.04 | -9.04 |  |
| 9.049999999999683 | 9.05 | -9.05 |  |
| 9.05999999999968 | 9.06 | -9.06 |  |
| 9.06999999999968 | 9.07 | -9.07 |  |
| 9.07999999999968 | 9.08 | -9.08 |  |
| 9.08999999999968 | 9.09 | -9.09 |  |
| 9.09999999999968 | 9.1 | -9.1 |  |
| 9.10999999999968 | 9.11 | -9.11 |  |
| 9.11999999999968 | 9.12 | -9.12 |  |
| 9.12999999999968 | 9.13 | -9.13 |  |
| 9.13999999999968 | 9.14 | -9.14 |  |
| 9.14999999999968 | 9.15 | -9.15 |  |
| 9.15999999999968 | 9.16 | -9.16 |  |
| 9.16999999999968 | 9.17 | -9.17 |  |
| 9.17999999999968 | 9.18 | -9.18 |  |
| 9.18999999999968 | 9.19 | -9.19 |  |
| 9.19999999999968 | 9.2 | -9.2 |  |
| 9.20999999999968 | 9.21 | -9.21 |  |
| 9.21999999999968 | 9.22 | -9.22 |  |
| 9.229999999999677 | 9.23 | -9.23 |  |
| 9.239999999999679 | 9.24 | -9.24 |  |
| 9.249999999999678 | 9.25 | -9.25 |  |
| 9.259999999999678 | 9.26 | -9.26 |  |
| 9.269999999999678 | 9.27 | -9.27 |  |
| 9.279999999999678 | 9.28 | -9.28 |  |
| 9.289999999999678 | 9.29 | -9.29 |  |
| 9.299999999999677 | 9.3 | -9.3 |  |
| 9.309999999999677 | 9.31 | -9.31 |  |
| 9.319999999999675 | 9.32 | -9.32 |  |
| 9.329999999999677 | 9.33 | -9.33 |  |
| 9.339999999999677 | 9.34 | -9.34 |  |
| 9.349999999999676 | 9.35 | -9.35 |  |
| 9.359999999999676 | 9.36 | -9.36 |  |
| 9.369999999999674 | 9.37 | -9.37 |  |
| 9.379999999999676 | 9.38 | -9.38 |  |
| 9.389999999999675 | 9.39 | -9.39 |  |
| 9.399999999999675 | 9.4 | -9.4 |  |
| 9.409999999999675 | 9.41 | -9.41 |  |
| 9.419999999999675 | 9.42 | -9.42 |  |
| 9.429999999999675 | 9.43 | -9.43 |  |
| 9.439999999999674 | 9.44 | -9.44 |  |
| 9.449999999999674 | 9.45 | -9.45 |  |
| 9.459999999999672 | 9.46 | -9.46 |  |
| 9.469999999999674 | 9.47 | -9.47 |  |
| 9.479999999999674 | 9.48 | -9.48 |  |
| 9.489999999999673 | 9.49 | -9.49 |  |
| 9.499999999999673 | 9.5 | -9.5 |  |
| 9.509999999999671 | 9.51 | -9.51 |  |
| 9.519999999999673 | 9.52 | -9.52 |  |
| 9.529999999999673 | 9.53 | -9.53 |  |
| 9.539999999999672 | 9.54 | -9.54 |  |
| 9.549999999999672 | 9.55 | -9.55 |  |
| 9.55999999999967 | 9.56 | -9.56 |  |
| 9.56999999999967 | 9.57 | -9.57 |  |
| 9.57999999999967 | 9.58 | -9.58 |  |
| 9.58999999999967 | 9.59 | -9.59 |  |
| 9.59999999999967 | 9.6 | -9.6 |  |
| 9.60999999999967 | 9.61 | -9.61 |  |
| 9.61999999999967 | 9.62 | -9.62 |  |
| 9.62999999999967 | 9.63 | -9.63 |  |
| 9.63999999999967 | 9.64 | -9.64 |  |
| 9.64999999999967 | 9.65 | -9.65 |  |
| 9.65999999999967 | 9.66 | -9.66 |  |
| 9.66999999999967 | 9.67 | -9.67 |  |
| 9.67999999999967 | 9.68 | -9.68 |  |
| 9.689999999999667 | 9.69 | -9.69 |  |
| 9.699999999999669 | 9.7 | -9.7 |  |
| 9.709999999999669 | 9.71 | -9.71 |  |
| 9.719999999999668 | 9.72 | -9.72 |  |
| 9.729999999999668 | 9.73 | -9.73 |  |
| 9.739999999999666 | 9.74 | -9.74 |  |
| 9.749999999999668 | 9.75 | -9.75 |  |
| 9.759999999999668 | 9.76 | -9.76 |  |
| 9.769999999999667 | 9.77 | -9.77 |  |
| 9.779999999999667 | 9.78 | -9.78 |  |
| 9.789999999999665 | 9.79 | -9.79 |  |
| 9.799999999999667 | 9.8 | -9.8 |  |
| 9.809999999999667 | 9.81 | -9.81 |  |
| 9.819999999999666 | 9.82 | -9.82 |  |
| 9.829999999999666 | 9.83 | -9.83 |  |
| 9.839999999999664 | 9.84 | -9.84 |  |
| 9.849999999999666 | 9.85 | -9.85 |  |
| 9.859999999999665 | 9.86 | -9.86 |  |
| 9.869999999999665 | 9.87 | -9.87 |  |
| 9.879999999999663 | 9.88 | -9.88 |  |
| 9.889999999999665 | 9.89 | -9.89 |  |
| 9.899999999999665 | 9.9 | -9.9 |  |
| 9.909999999999664 | 9.91 | -9.91 |  |
| 9.919999999999664 | 9.92 | -9.92 |  |
| 9.929999999999662 | 9.93 | -9.93 |  |
| 9.939999999999664 | 9.94 | -9.94 |  |
| 9.949999999999664 | 9.95 | -9.95 |  |
| 9.95999999999966 | 9.96 | -9.96 |  |
| 9.96999999999966 | 9.97 | -9.97 |  |
| 9.97999999999966 | 9.98 | -9.98 |  |
| 9.98999999999966 | 9.99 | -9.99 |  |
| 9.99999999999966 | 10 | -10 |  |